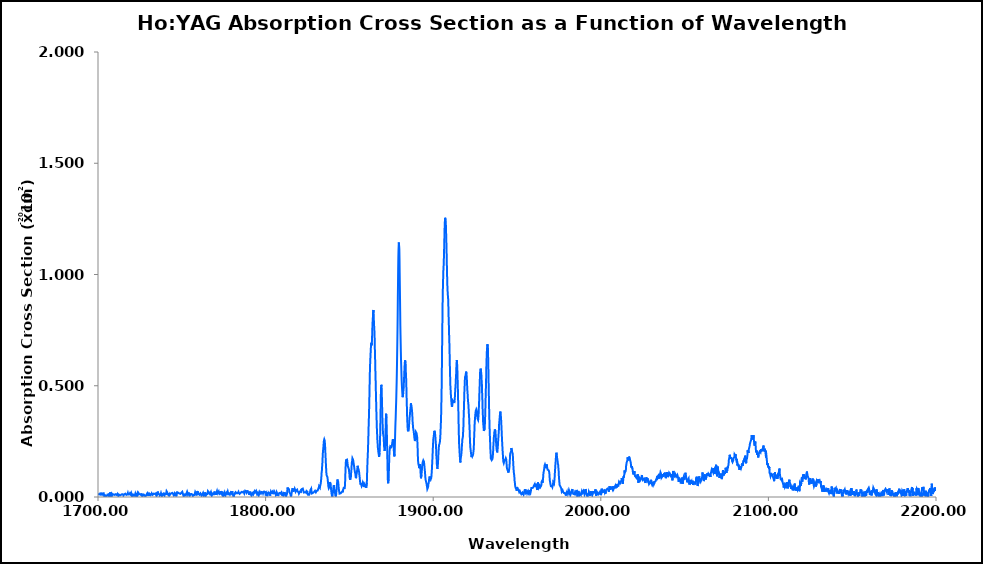
| Category | Series 0 |
|---|---|
| 1700.0 | 0.013 |
| 1700.1 | 0.012 |
| 1700.2 | 0.011 |
| 1700.3 | 0.011 |
| 1700.4 | 0.012 |
| 1700.5 | 0.014 |
| 1700.6 | 0.012 |
| 1700.7 | 0.012 |
| 1700.8 | 0.011 |
| 1700.9 | 0.011 |
| 1701.0 | 0.012 |
| 1701.1 | 0.014 |
| 1701.2 | 0.011 |
| 1701.3 | 0.016 |
| 1701.4 | 0.016 |
| 1701.5 | 0.014 |
| 1701.6 | 0.015 |
| 1701.7 | 0.016 |
| 1701.8 | 0.015 |
| 1701.9 | 0.017 |
| 1702.0 | 0.017 |
| 1702.1 | 0.017 |
| 1702.2 | 0.015 |
| 1702.3 | 0.015 |
| 1702.4 | 0.011 |
| 1702.5 | 0.012 |
| 1702.6 | 0.014 |
| 1702.7 | 0.011 |
| 1702.8 | 0.016 |
| 1702.9 | 0.016 |
| 1703.0 | 0.015 |
| 1703.1 | 0.016 |
| 1703.2 | 0.015 |
| 1703.3 | 0.017 |
| 1703.4 | 0.017 |
| 1703.5 | 0.017 |
| 1703.6 | 0.009 |
| 1703.7 | 0.003 |
| 1703.8 | 0.003 |
| 1703.9 | 0.004 |
| 1704.0 | 0.005 |
| 1704.1 | 0.006 |
| 1704.2 | 0.007 |
| 1704.3 | 0.007 |
| 1704.4 | 0.008 |
| 1704.5 | 0.01 |
| 1704.6 | 0.01 |
| 1704.7 | 0.006 |
| 1704.8 | 0.002 |
| 1704.9 | 0.002 |
| 1705.0 | 0.003 |
| 1705.1 | 0.002 |
| 1705.2 | 0.003 |
| 1705.3 | 0.005 |
| 1705.4 | 0.006 |
| 1705.5 | 0.007 |
| 1705.6 | 0.011 |
| 1705.7 | 0.011 |
| 1705.8 | 0.012 |
| 1705.9 | 0.014 |
| 1706.0 | 0.014 |
| 1706.1 | 0.011 |
| 1706.2 | 0.012 |
| 1706.3 | 0.013 |
| 1706.4 | 0.011 |
| 1706.5 | 0.011 |
| 1706.6 | 0.005 |
| 1706.7 | 0 |
| 1706.8 | 0 |
| 1706.9 | 0.002 |
| 1707.0 | 0.004 |
| 1707.1 | 0.014 |
| 1707.2 | 0.021 |
| 1707.3 | 0.016 |
| 1707.4 | 0.016 |
| 1707.5 | 0.013 |
| 1707.6 | 0.008 |
| 1707.7 | 0.001 |
| 1707.8 | 0.013 |
| 1707.9 | 0.001 |
| 1708.0 | 0.001 |
| 1708.1 | 0.005 |
| 1708.2 | 0.009 |
| 1708.3 | 0.015 |
| 1708.4 | 0.013 |
| 1708.5 | 0.014 |
| 1708.6 | 0.012 |
| 1708.7 | 0.012 |
| 1708.8 | 0.01 |
| 1708.9 | 0.008 |
| 1709.0 | 0.007 |
| 1709.1 | 0.006 |
| 1709.2 | 0.008 |
| 1709.3 | 0.011 |
| 1709.4 | 0.012 |
| 1709.5 | 0.012 |
| 1709.6 | 0.012 |
| 1709.7 | 0.014 |
| 1709.8 | 0.013 |
| 1709.9 | 0.011 |
| 1710.0 | 0.009 |
| 1710.1 | 0.012 |
| 1710.2 | 0.011 |
| 1710.3 | 0.006 |
| 1710.4 | 0.01 |
| 1710.5 | 0.011 |
| 1710.6 | 0.013 |
| 1710.7 | 0.01 |
| 1710.8 | 0.009 |
| 1710.9 | 0.011 |
| 1711.0 | 0.01 |
| 1711.1 | 0.009 |
| 1711.2 | 0.009 |
| 1711.3 | 0.01 |
| 1711.4 | 0.01 |
| 1711.5 | 0.011 |
| 1711.6 | 0.01 |
| 1711.7 | 0.015 |
| 1711.8 | 0.016 |
| 1711.9 | 0.015 |
| 1712.0 | 0.016 |
| 1712.1 | 0.01 |
| 1712.2 | 0.005 |
| 1712.3 | 0.006 |
| 1712.4 | 0.006 |
| 1712.5 | 0.004 |
| 1712.6 | 0.01 |
| 1712.7 | 0.012 |
| 1712.8 | 0.011 |
| 1712.9 | 0.01 |
| 1713.0 | 0.009 |
| 1713.1 | 0.007 |
| 1713.2 | 0.007 |
| 1713.3 | 0.007 |
| 1713.4 | 0.006 |
| 1713.5 | 0.007 |
| 1713.6 | 0.009 |
| 1713.7 | 0.009 |
| 1713.8 | 0.01 |
| 1713.9 | 0.008 |
| 1714.0 | 0.008 |
| 1714.1 | 0.009 |
| 1714.2 | 0.007 |
| 1714.3 | 0.008 |
| 1714.4 | 0.013 |
| 1714.5 | 0.011 |
| 1714.6 | 0.009 |
| 1714.7 | 0.012 |
| 1714.8 | 0.013 |
| 1714.9 | 0.01 |
| 1715.0 | 0.011 |
| 1715.1 | 0.008 |
| 1715.2 | 0.007 |
| 1715.3 | 0.004 |
| 1715.4 | 0.008 |
| 1715.5 | 0.006 |
| 1715.6 | 0.009 |
| 1715.7 | 0.012 |
| 1715.8 | 0.012 |
| 1715.9 | 0.01 |
| 1716.0 | 0.012 |
| 1716.1 | 0.009 |
| 1716.2 | 0.011 |
| 1716.3 | 0.015 |
| 1716.4 | 0.017 |
| 1716.5 | 0.016 |
| 1716.6 | 0.018 |
| 1716.7 | 0.014 |
| 1716.8 | 0.011 |
| 1716.9 | 0.01 |
| 1717.0 | 0.009 |
| 1717.1 | 0.011 |
| 1717.2 | 0.011 |
| 1717.3 | 0.006 |
| 1717.4 | 0.01 |
| 1717.5 | 0.012 |
| 1717.6 | 0.012 |
| 1717.7 | 0.013 |
| 1717.8 | 0.018 |
| 1717.9 | 0.014 |
| 1718.0 | 0.012 |
| 1718.1 | 0.011 |
| 1718.2 | 0.013 |
| 1718.3 | 0.013 |
| 1718.4 | 0.014 |
| 1718.5 | 0.014 |
| 1718.6 | 0.012 |
| 1718.7 | 0.011 |
| 1718.8 | 0.012 |
| 1718.9 | 0.013 |
| 1719.0 | 0.016 |
| 1719.1 | 0.016 |
| 1719.2 | 0.016 |
| 1719.3 | 0.014 |
| 1719.4 | 0.012 |
| 1719.5 | 0.012 |
| 1719.6 | 0.015 |
| 1719.7 | 0.014 |
| 1719.8 | 0.019 |
| 1719.9 | 0.016 |
| 1720.0 | 0.015 |
| 1720.1 | 0.012 |
| 1720.2 | 0.01 |
| 1720.3 | 0.002 |
| 1720.4 | 0.004 |
| 1720.5 | 0.004 |
| 1720.6 | 0.002 |
| 1720.7 | 0.003 |
| 1720.8 | 0.01 |
| 1720.9 | 0.011 |
| 1721.0 | 0.007 |
| 1721.1 | 0.01 |
| 1721.2 | 0.009 |
| 1721.3 | 0.007 |
| 1721.4 | 0.006 |
| 1721.5 | 0.011 |
| 1721.6 | 0.011 |
| 1721.7 | 0.01 |
| 1721.8 | 0.008 |
| 1721.9 | 0.012 |
| 1722.0 | 0.01 |
| 1722.1 | 0.01 |
| 1722.2 | 0.014 |
| 1722.3 | 0.015 |
| 1722.4 | 0.013 |
| 1722.5 | 0.01 |
| 1722.6 | 0.003 |
| 1722.7 | 0.002 |
| 1722.8 | 0.018 |
| 1722.9 | 0.012 |
| 1723.0 | 0 |
| 1723.1 | 0.011 |
| 1723.2 | 0.009 |
| 1723.3 | 0.014 |
| 1723.4 | 0.016 |
| 1723.5 | 0.013 |
| 1723.6 | 0.007 |
| 1723.7 | 0.012 |
| 1723.8 | 0.008 |
| 1723.9 | 0.012 |
| 1724.0 | 0.016 |
| 1724.1 | 0.019 |
| 1724.2 | 0.021 |
| 1724.3 | 0.021 |
| 1724.4 | 0.02 |
| 1724.5 | 0.018 |
| 1724.6 | 0.018 |
| 1724.7 | 0.012 |
| 1724.8 | 0.012 |
| 1724.9 | 0.011 |
| 1725.0 | 0.009 |
| 1725.1 | 0.009 |
| 1725.2 | 0.009 |
| 1725.3 | 0.012 |
| 1725.4 | 0.012 |
| 1725.5 | 0.01 |
| 1725.6 | 0.012 |
| 1725.7 | 0.012 |
| 1725.8 | 0.008 |
| 1725.9 | 0.008 |
| 1726.0 | 0.013 |
| 1726.1 | 0.013 |
| 1726.2 | 0.013 |
| 1726.3 | 0.016 |
| 1726.4 | 0.016 |
| 1726.5 | 0.014 |
| 1726.6 | 0.012 |
| 1726.7 | 0.008 |
| 1726.8 | 0.006 |
| 1726.9 | 0.007 |
| 1727.0 | 0.006 |
| 1727.1 | 0.005 |
| 1727.2 | 0.009 |
| 1727.3 | 0.011 |
| 1727.4 | 0.01 |
| 1727.5 | 0.009 |
| 1727.6 | 0.009 |
| 1727.7 | 0.009 |
| 1727.8 | 0.008 |
| 1727.9 | 0.007 |
| 1728.0 | 0.006 |
| 1728.1 | 0.007 |
| 1728.2 | 0.002 |
| 1728.3 | 0.004 |
| 1728.4 | 0.006 |
| 1728.5 | 0.001 |
| 1728.6 | 0.002 |
| 1728.7 | 0.007 |
| 1728.8 | 0.007 |
| 1728.9 | 0.011 |
| 1729.0 | 0.011 |
| 1729.1 | 0.013 |
| 1729.2 | 0.01 |
| 1729.3 | 0.006 |
| 1729.4 | 0.012 |
| 1729.5 | 0.012 |
| 1729.6 | 0.014 |
| 1729.7 | 0.018 |
| 1729.8 | 0.022 |
| 1729.9 | 0.017 |
| 1730.0 | 0.02 |
| 1730.1 | 0.015 |
| 1730.2 | 0.015 |
| 1730.3 | 0.012 |
| 1730.4 | 0.012 |
| 1730.5 | 0.005 |
| 1730.6 | 0.006 |
| 1730.7 | 0.007 |
| 1730.8 | 0.013 |
| 1730.9 | 0.013 |
| 1731.0 | 0.016 |
| 1731.1 | 0.015 |
| 1731.2 | 0.015 |
| 1731.3 | 0.009 |
| 1731.4 | 0.011 |
| 1731.5 | 0.012 |
| 1731.6 | 0.012 |
| 1731.7 | 0.012 |
| 1731.8 | 0.014 |
| 1731.9 | 0.008 |
| 1732.0 | 0.011 |
| 1732.1 | 0.015 |
| 1732.2 | 0.016 |
| 1732.3 | 0.016 |
| 1732.4 | 0.017 |
| 1732.5 | 0.015 |
| 1732.6 | 0.01 |
| 1732.7 | 0.009 |
| 1732.8 | 0.007 |
| 1732.9 | 0.012 |
| 1733.0 | 0.008 |
| 1733.1 | 0.013 |
| 1733.2 | 0.015 |
| 1733.3 | 0.019 |
| 1733.4 | 0.015 |
| 1733.5 | 0.019 |
| 1733.6 | 0.017 |
| 1733.7 | 0.018 |
| 1733.8 | 0.014 |
| 1733.9 | 0.015 |
| 1734.0 | 0.014 |
| 1734.1 | 0.013 |
| 1734.2 | 0.012 |
| 1734.3 | 0.015 |
| 1734.4 | 0.016 |
| 1734.5 | 0.013 |
| 1734.6 | 0.01 |
| 1734.7 | 0.01 |
| 1734.8 | 0.008 |
| 1734.9 | 0.004 |
| 1735.0 | 0.006 |
| 1735.1 | 0.008 |
| 1735.2 | 0.009 |
| 1735.3 | 0.01 |
| 1735.4 | 0.013 |
| 1735.5 | 0.019 |
| 1735.6 | 0.024 |
| 1735.7 | 0.022 |
| 1735.8 | 0.022 |
| 1735.9 | 0.025 |
| 1736.0 | 0.022 |
| 1736.1 | 0.014 |
| 1736.2 | 0.017 |
| 1736.3 | 0.018 |
| 1736.4 | 0.015 |
| 1736.5 | 0.013 |
| 1736.6 | 0.014 |
| 1736.7 | 0.012 |
| 1736.8 | 0.007 |
| 1736.9 | 0.004 |
| 1737.0 | 0.004 |
| 1737.1 | 0.004 |
| 1737.2 | 0.009 |
| 1737.3 | 0.009 |
| 1737.4 | 0.012 |
| 1737.5 | 0.013 |
| 1737.6 | 0.017 |
| 1737.7 | 0.014 |
| 1737.8 | 0.014 |
| 1737.9 | 0.01 |
| 1738.0 | 0.008 |
| 1738.1 | 0.003 |
| 1738.2 | 0.004 |
| 1738.3 | 0.002 |
| 1738.4 | 0.006 |
| 1738.5 | 0.008 |
| 1738.6 | 0.014 |
| 1738.7 | 0.011 |
| 1738.8 | 0.011 |
| 1738.9 | 0.013 |
| 1739.0 | 0.014 |
| 1739.1 | 0.013 |
| 1739.2 | 0.016 |
| 1739.3 | 0.019 |
| 1739.4 | 0.019 |
| 1739.5 | 0.013 |
| 1739.6 | 0.012 |
| 1739.7 | 0.007 |
| 1739.8 | 0.008 |
| 1739.9 | 0.008 |
| 1740.0 | 0.014 |
| 1740.1 | 0.014 |
| 1740.2 | 0.014 |
| 1740.3 | 0.016 |
| 1740.4 | 0.013 |
| 1740.5 | 0.011 |
| 1740.6 | 0.013 |
| 1740.7 | 0.019 |
| 1740.8 | 0.022 |
| 1740.9 | 0.026 |
| 1741.0 | 0.031 |
| 1741.1 | 0.028 |
| 1741.2 | 0.027 |
| 1741.3 | 0.021 |
| 1741.4 | 0.017 |
| 1741.5 | 0.014 |
| 1741.6 | 0.012 |
| 1741.7 | 0.012 |
| 1741.8 | 0.011 |
| 1741.9 | 0.011 |
| 1742.0 | 0.009 |
| 1742.1 | 0.011 |
| 1742.2 | 0.012 |
| 1742.3 | 0.01 |
| 1742.4 | 0.012 |
| 1742.5 | 0.014 |
| 1742.6 | 0.014 |
| 1742.7 | 0.008 |
| 1742.8 | 0.009 |
| 1742.9 | 0.008 |
| 1743.0 | 0.01 |
| 1743.1 | 0.01 |
| 1743.2 | 0.013 |
| 1743.3 | 0.013 |
| 1743.4 | 0.011 |
| 1743.5 | 0.011 |
| 1743.6 | 0.013 |
| 1743.7 | 0.016 |
| 1743.8 | 0.017 |
| 1743.9 | 0.021 |
| 1744.0 | 0.019 |
| 1744.1 | 0.016 |
| 1744.2 | 0.014 |
| 1744.3 | 0.016 |
| 1744.4 | 0.019 |
| 1744.5 | 0.018 |
| 1744.6 | 0.018 |
| 1744.7 | 0.017 |
| 1744.8 | 0.014 |
| 1744.9 | 0.01 |
| 1745.0 | 0.013 |
| 1745.1 | 0.009 |
| 1745.2 | 0.01 |
| 1745.3 | 0.012 |
| 1745.4 | 0.011 |
| 1745.5 | 0.012 |
| 1745.6 | 0.016 |
| 1745.7 | 0.012 |
| 1745.8 | 0.01 |
| 1745.9 | 0.009 |
| 1746.0 | 0.009 |
| 1746.1 | 0.012 |
| 1746.2 | 0.012 |
| 1746.3 | 0.013 |
| 1746.4 | 0.015 |
| 1746.5 | 0.011 |
| 1746.6 | 0.003 |
| 1746.7 | 0.006 |
| 1746.8 | 0.006 |
| 1746.9 | 0.009 |
| 1747.0 | 0.01 |
| 1747.1 | 0.018 |
| 1747.2 | 0.024 |
| 1747.3 | 0.025 |
| 1747.4 | 0.017 |
| 1747.5 | 0.02 |
| 1747.6 | 0.019 |
| 1747.7 | 0.014 |
| 1747.8 | 0.013 |
| 1747.9 | 0.017 |
| 1748.0 | 0.019 |
| 1748.1 | 0.016 |
| 1748.2 | 0.018 |
| 1748.3 | 0.019 |
| 1748.4 | 0.016 |
| 1748.5 | 0.015 |
| 1748.6 | 0.015 |
| 1748.7 | 0.013 |
| 1748.8 | 0.011 |
| 1748.9 | 0.014 |
| 1749.0 | 0.014 |
| 1749.1 | 0.014 |
| 1749.2 | 0.014 |
| 1749.3 | 0.018 |
| 1749.4 | 0.016 |
| 1749.5 | 0.014 |
| 1749.6 | 0.016 |
| 1749.7 | 0.019 |
| 1749.8 | 0.015 |
| 1749.9 | 0.018 |
| 1750.0 | 0.021 |
| 1750.1 | 0.018 |
| 1750.2 | 0.016 |
| 1750.3 | 0.023 |
| 1750.4 | 0.021 |
| 1750.5 | 0.018 |
| 1750.6 | 0.02 |
| 1750.7 | 0.017 |
| 1750.8 | 0.01 |
| 1750.9 | 0.008 |
| 1751.0 | 0.007 |
| 1751.1 | 0.003 |
| 1751.2 | 0.006 |
| 1751.3 | 0.008 |
| 1751.4 | 0.01 |
| 1751.5 | 0.011 |
| 1751.6 | 0.015 |
| 1751.7 | 0.013 |
| 1751.8 | 0.007 |
| 1751.9 | 0.01 |
| 1752.0 | 0.006 |
| 1752.1 | 0.003 |
| 1752.2 | 0.004 |
| 1752.3 | 0.01 |
| 1752.4 | 0.006 |
| 1752.5 | 0.013 |
| 1752.6 | 0.016 |
| 1752.7 | 0.012 |
| 1752.8 | 0.011 |
| 1752.9 | 0.018 |
| 1753.0 | 0.017 |
| 1753.1 | 0.016 |
| 1753.2 | 0.024 |
| 1753.3 | 0.026 |
| 1753.4 | 0.022 |
| 1753.5 | 0.017 |
| 1753.6 | 0.018 |
| 1753.7 | 0.01 |
| 1753.8 | 0.01 |
| 1753.9 | 0.01 |
| 1754.0 | 0.014 |
| 1754.1 | 0.014 |
| 1754.2 | 0.02 |
| 1754.3 | 0.013 |
| 1754.4 | 0.014 |
| 1754.5 | 0.013 |
| 1754.6 | 0.013 |
| 1754.7 | 0.008 |
| 1754.8 | 0.014 |
| 1754.9 | 0.013 |
| 1755.0 | 0.01 |
| 1755.1 | 0.007 |
| 1755.2 | 0.013 |
| 1755.3 | 0.01 |
| 1755.4 | 0.011 |
| 1755.5 | 0.013 |
| 1755.6 | 0.016 |
| 1755.7 | 0.016 |
| 1755.8 | 0.014 |
| 1755.9 | 0.012 |
| 1756.0 | 0.016 |
| 1756.1 | 0.013 |
| 1756.2 | 0.009 |
| 1756.3 | 0.013 |
| 1756.4 | 0.011 |
| 1756.5 | 0.008 |
| 1756.6 | 0.005 |
| 1756.7 | 0.007 |
| 1756.8 | 0.006 |
| 1756.9 | 0.009 |
| 1757.0 | 0.007 |
| 1757.1 | 0.01 |
| 1757.2 | 0.01 |
| 1757.3 | 0.01 |
| 1757.4 | 0.01 |
| 1757.5 | 0.009 |
| 1757.6 | 0.013 |
| 1757.7 | 0.013 |
| 1757.8 | 0.016 |
| 1757.9 | 0.02 |
| 1758.0 | 0.022 |
| 1758.1 | 0.023 |
| 1758.2 | 0.024 |
| 1758.3 | 0.024 |
| 1758.4 | 0.02 |
| 1758.5 | 0.02 |
| 1758.6 | 0.012 |
| 1758.7 | 0.009 |
| 1758.8 | 0.007 |
| 1758.9 | 0.007 |
| 1759.0 | 0.011 |
| 1759.1 | 0.02 |
| 1759.2 | 0.024 |
| 1759.3 | 0.026 |
| 1759.4 | 0.024 |
| 1759.5 | 0.022 |
| 1759.6 | 0.019 |
| 1759.7 | 0.017 |
| 1759.8 | 0.01 |
| 1759.9 | 0.017 |
| 1760.0 | 0.02 |
| 1760.1 | 0.018 |
| 1760.2 | 0.019 |
| 1760.3 | 0.02 |
| 1760.4 | 0.015 |
| 1760.5 | 0.011 |
| 1760.6 | 0.009 |
| 1760.7 | 0.009 |
| 1760.8 | 0.014 |
| 1760.9 | 0.014 |
| 1761.0 | 0.015 |
| 1761.1 | 0.016 |
| 1761.2 | 0.016 |
| 1761.3 | 0.012 |
| 1761.4 | 0.013 |
| 1761.5 | 0.01 |
| 1761.6 | 0.01 |
| 1761.7 | 0.009 |
| 1761.8 | 0.005 |
| 1761.9 | 0.009 |
| 1762.0 | 0.01 |
| 1762.1 | 0.01 |
| 1762.2 | 0.009 |
| 1762.3 | 0.013 |
| 1762.4 | 0.011 |
| 1762.5 | 0.013 |
| 1762.6 | 0.014 |
| 1762.7 | 0.019 |
| 1762.8 | 0.02 |
| 1762.9 | 0.019 |
| 1763.0 | 0.012 |
| 1763.1 | 0.009 |
| 1763.2 | 0.005 |
| 1763.3 | 0.005 |
| 1763.4 | 0.005 |
| 1763.5 | 0.007 |
| 1763.6 | 0.009 |
| 1763.7 | 0.01 |
| 1763.8 | 0.016 |
| 1763.9 | 0.018 |
| 1764.0 | 0.021 |
| 1764.1 | 0.017 |
| 1764.2 | 0.013 |
| 1764.3 | 0.006 |
| 1764.4 | 0.004 |
| 1764.5 | 0.003 |
| 1764.6 | 0.006 |
| 1764.7 | 0.011 |
| 1764.8 | 0.012 |
| 1764.9 | 0.011 |
| 1765.0 | 0.011 |
| 1765.1 | 0.014 |
| 1765.2 | 0.014 |
| 1765.3 | 0.013 |
| 1765.4 | 0.016 |
| 1765.5 | 0.022 |
| 1765.6 | 0.026 |
| 1765.7 | 0.028 |
| 1765.8 | 0.027 |
| 1765.9 | 0.027 |
| 1766.0 | 0.026 |
| 1766.1 | 0.023 |
| 1766.2 | 0.02 |
| 1766.3 | 0.02 |
| 1766.4 | 0.022 |
| 1766.5 | 0.018 |
| 1766.6 | 0.015 |
| 1766.7 | 0.018 |
| 1766.8 | 0.024 |
| 1766.9 | 0.021 |
| 1767.0 | 0.024 |
| 1767.1 | 0.017 |
| 1767.2 | 0.021 |
| 1767.3 | 0.02 |
| 1767.4 | 0.022 |
| 1767.5 | 0.02 |
| 1767.6 | 0.022 |
| 1767.7 | 0.018 |
| 1767.8 | 0.012 |
| 1767.9 | 0.007 |
| 1768.0 | 0.005 |
| 1768.1 | 0.011 |
| 1768.2 | 0.006 |
| 1768.3 | 0.011 |
| 1768.4 | 0.015 |
| 1768.5 | 0.019 |
| 1768.6 | 0.015 |
| 1768.7 | 0.019 |
| 1768.8 | 0.015 |
| 1768.9 | 0.013 |
| 1769.0 | 0.012 |
| 1769.1 | 0.009 |
| 1769.2 | 0.011 |
| 1769.3 | 0.019 |
| 1769.4 | 0.02 |
| 1769.5 | 0.018 |
| 1769.6 | 0.025 |
| 1769.7 | 0.017 |
| 1769.8 | 0.015 |
| 1769.9 | 0.014 |
| 1770.0 | 0.01 |
| 1770.1 | 0.012 |
| 1770.2 | 0.017 |
| 1770.3 | 0.013 |
| 1770.4 | 0.01 |
| 1770.5 | 0.015 |
| 1770.6 | 0.016 |
| 1770.7 | 0.017 |
| 1770.8 | 0.017 |
| 1770.9 | 0.019 |
| 1771.0 | 0.027 |
| 1771.1 | 0.023 |
| 1771.2 | 0.02 |
| 1771.3 | 0.025 |
| 1771.4 | 0.025 |
| 1771.5 | 0.018 |
| 1771.6 | 0.018 |
| 1771.7 | 0.019 |
| 1771.8 | 0.019 |
| 1771.9 | 0.019 |
| 1772.0 | 0.024 |
| 1772.1 | 0.02 |
| 1772.2 | 0.018 |
| 1772.3 | 0.017 |
| 1772.4 | 0.016 |
| 1772.5 | 0.013 |
| 1772.6 | 0.016 |
| 1772.7 | 0.017 |
| 1772.8 | 0.012 |
| 1772.9 | 0.013 |
| 1773.0 | 0.016 |
| 1773.1 | 0.015 |
| 1773.2 | 0.02 |
| 1773.3 | 0.027 |
| 1773.4 | 0.027 |
| 1773.5 | 0.02 |
| 1773.6 | 0.019 |
| 1773.7 | 0.02 |
| 1773.8 | 0.015 |
| 1773.9 | 0.017 |
| 1774.0 | 0.024 |
| 1774.1 | 0.021 |
| 1774.2 | 0.014 |
| 1774.3 | 0.013 |
| 1774.4 | 0.01 |
| 1774.5 | 0.007 |
| 1774.6 | 0.011 |
| 1774.7 | 0.013 |
| 1774.8 | 0.011 |
| 1774.9 | 0.009 |
| 1775.0 | 0.007 |
| 1775.1 | 0.005 |
| 1775.2 | 0.007 |
| 1775.3 | 0.012 |
| 1775.4 | 0.013 |
| 1775.5 | 0.016 |
| 1775.6 | 0.02 |
| 1775.7 | 0.02 |
| 1775.8 | 0.015 |
| 1775.9 | 0.016 |
| 1776.0 | 0.014 |
| 1776.1 | 0.008 |
| 1776.2 | 0.005 |
| 1776.3 | 0.013 |
| 1776.4 | 0.012 |
| 1776.5 | 0.017 |
| 1776.6 | 0.016 |
| 1776.7 | 0.019 |
| 1776.8 | 0.016 |
| 1776.9 | 0.015 |
| 1777.0 | 0.011 |
| 1777.1 | 0.017 |
| 1777.2 | 0.017 |
| 1777.3 | 0.02 |
| 1777.4 | 0.025 |
| 1777.5 | 0.021 |
| 1777.6 | 0.019 |
| 1777.7 | 0.017 |
| 1777.8 | 0.013 |
| 1777.9 | 0.011 |
| 1778.0 | 0.015 |
| 1778.1 | 0.017 |
| 1778.2 | 0.014 |
| 1778.3 | 0.015 |
| 1778.4 | 0.016 |
| 1778.5 | 0.013 |
| 1778.6 | 0.011 |
| 1778.7 | 0.011 |
| 1778.8 | 0.013 |
| 1778.9 | 0.014 |
| 1779.0 | 0.013 |
| 1779.1 | 0.011 |
| 1779.2 | 0.02 |
| 1779.3 | 0.023 |
| 1779.4 | 0.022 |
| 1779.5 | 0.022 |
| 1779.6 | 0.023 |
| 1779.7 | 0.021 |
| 1779.8 | 0.014 |
| 1779.9 | 0.016 |
| 1780.0 | 0.02 |
| 1780.1 | 0.026 |
| 1780.2 | 0.018 |
| 1780.3 | 0.019 |
| 1780.4 | 0.015 |
| 1780.5 | 0.018 |
| 1780.6 | 0.009 |
| 1780.7 | 0.013 |
| 1780.8 | 0.012 |
| 1780.9 | 0.01 |
| 1781.0 | 0.001 |
| 1781.1 | 0.007 |
| 1781.2 | 0.011 |
| 1781.3 | 0.011 |
| 1781.4 | 0.013 |
| 1781.5 | 0.019 |
| 1781.6 | 0.014 |
| 1781.7 | 0.01 |
| 1781.8 | 0.012 |
| 1781.9 | 0.017 |
| 1782.0 | 0.017 |
| 1782.1 | 0.022 |
| 1782.2 | 0.021 |
| 1782.3 | 0.023 |
| 1782.4 | 0.02 |
| 1782.5 | 0.019 |
| 1782.6 | 0.018 |
| 1782.7 | 0.017 |
| 1782.8 | 0.017 |
| 1782.9 | 0.018 |
| 1783.0 | 0.018 |
| 1783.1 | 0.017 |
| 1783.2 | 0.013 |
| 1783.3 | 0.017 |
| 1783.4 | 0.016 |
| 1783.5 | 0.016 |
| 1783.6 | 0.017 |
| 1783.7 | 0.022 |
| 1783.8 | 0.014 |
| 1783.9 | 0.015 |
| 1784.0 | 0.019 |
| 1784.1 | 0.021 |
| 1784.2 | 0.023 |
| 1784.3 | 0.022 |
| 1784.4 | 0.019 |
| 1784.5 | 0.014 |
| 1784.6 | 0.012 |
| 1784.7 | 0.01 |
| 1784.8 | 0.014 |
| 1784.9 | 0.013 |
| 1785.0 | 0.017 |
| 1785.1 | 0.018 |
| 1785.2 | 0.021 |
| 1785.3 | 0.022 |
| 1785.4 | 0.022 |
| 1785.5 | 0.021 |
| 1785.6 | 0.023 |
| 1785.7 | 0.022 |
| 1785.8 | 0.023 |
| 1785.9 | 0.025 |
| 1786.0 | 0.022 |
| 1786.1 | 0.021 |
| 1786.2 | 0.021 |
| 1786.3 | 0.021 |
| 1786.4 | 0.021 |
| 1786.5 | 0.022 |
| 1786.6 | 0.021 |
| 1786.7 | 0.023 |
| 1786.8 | 0.024 |
| 1786.9 | 0.023 |
| 1787.0 | 0.022 |
| 1787.1 | 0.023 |
| 1787.2 | 0.021 |
| 1787.3 | 0.015 |
| 1787.4 | 0.015 |
| 1787.5 | 0.019 |
| 1787.6 | 0.022 |
| 1787.7 | 0.022 |
| 1787.8 | 0.028 |
| 1787.9 | 0.031 |
| 1788.0 | 0.029 |
| 1788.1 | 0.027 |
| 1788.2 | 0.026 |
| 1788.3 | 0.027 |
| 1788.4 | 0.026 |
| 1788.5 | 0.024 |
| 1788.6 | 0.023 |
| 1788.7 | 0.02 |
| 1788.8 | 0.02 |
| 1788.9 | 0.019 |
| 1789.0 | 0.024 |
| 1789.1 | 0.03 |
| 1789.2 | 0.029 |
| 1789.3 | 0.024 |
| 1789.4 | 0.027 |
| 1789.5 | 0.027 |
| 1789.6 | 0.023 |
| 1789.7 | 0.025 |
| 1789.8 | 0.026 |
| 1789.9 | 0.02 |
| 1790.0 | 0.018 |
| 1790.1 | 0.01 |
| 1790.2 | 0.011 |
| 1790.3 | 0.011 |
| 1790.4 | 0.014 |
| 1790.5 | 0.013 |
| 1790.6 | 0.02 |
| 1790.7 | 0.021 |
| 1790.8 | 0.024 |
| 1790.9 | 0.02 |
| 1791.0 | 0.022 |
| 1791.1 | 0.021 |
| 1791.2 | 0.019 |
| 1791.3 | 0.01 |
| 1791.4 | 0.009 |
| 1791.5 | 0.007 |
| 1791.6 | 0.005 |
| 1791.7 | 0.002 |
| 1791.8 | 0.002 |
| 1791.9 | 0.009 |
| 1792.0 | 0.007 |
| 1792.1 | 0.014 |
| 1792.2 | 0.019 |
| 1792.3 | 0.022 |
| 1792.4 | 0.021 |
| 1792.5 | 0.022 |
| 1792.6 | 0.02 |
| 1792.7 | 0.02 |
| 1792.8 | 0.022 |
| 1792.9 | 0.017 |
| 1793.0 | 0.018 |
| 1793.1 | 0.016 |
| 1793.2 | 0.017 |
| 1793.3 | 0.018 |
| 1793.4 | 0.026 |
| 1793.5 | 0.026 |
| 1793.6 | 0.026 |
| 1793.7 | 0.021 |
| 1793.8 | 0.019 |
| 1793.9 | 0.02 |
| 1794.0 | 0.022 |
| 1794.1 | 0.022 |
| 1794.2 | 0.025 |
| 1794.3 | 0.027 |
| 1794.4 | 0.026 |
| 1794.5 | 0.02 |
| 1794.6 | 0.021 |
| 1794.7 | 0.022 |
| 1794.8 | 0.017 |
| 1794.9 | 0.012 |
| 1795.0 | 0.014 |
| 1795.1 | 0.014 |
| 1795.2 | 0.012 |
| 1795.3 | 0.016 |
| 1795.4 | 0.02 |
| 1795.5 | 0.02 |
| 1795.6 | 0.014 |
| 1795.7 | 0.017 |
| 1795.8 | 0.013 |
| 1795.9 | 0.007 |
| 1796.0 | 0.006 |
| 1796.1 | 0.012 |
| 1796.2 | 0.008 |
| 1796.3 | 0.015 |
| 1796.4 | 0.019 |
| 1796.5 | 0.019 |
| 1796.6 | 0.024 |
| 1796.7 | 0.027 |
| 1796.8 | 0.023 |
| 1796.9 | 0.026 |
| 1797.0 | 0.026 |
| 1797.1 | 0.025 |
| 1797.2 | 0.016 |
| 1797.3 | 0.018 |
| 1797.4 | 0.02 |
| 1797.5 | 0.022 |
| 1797.6 | 0.017 |
| 1797.7 | 0.022 |
| 1797.8 | 0.023 |
| 1797.9 | 0.021 |
| 1798.0 | 0.019 |
| 1798.1 | 0.023 |
| 1798.2 | 0.024 |
| 1798.3 | 0.021 |
| 1798.4 | 0.019 |
| 1798.5 | 0.016 |
| 1798.6 | 0.019 |
| 1798.7 | 0.018 |
| 1798.8 | 0.022 |
| 1798.9 | 0.022 |
| 1799.0 | 0.028 |
| 1799.1 | 0.021 |
| 1799.2 | 0.02 |
| 1799.3 | 0.018 |
| 1799.4 | 0.021 |
| 1799.5 | 0.021 |
| 1799.6 | 0.023 |
| 1799.7 | 0.022 |
| 1799.8 | 0.021 |
| 1799.9 | 0.017 |
| 1800.0 | 0.013 |
| 1800.1 | 0.01 |
| 1800.2 | 0.012 |
| 1800.3 | 0.014 |
| 1800.4 | 0.015 |
| 1800.5 | 0.019 |
| 1800.6 | 0.013 |
| 1800.7 | 0.016 |
| 1800.8 | 0.009 |
| 1800.9 | 0.009 |
| 1801.0 | 0.004 |
| 1801.1 | 0.01 |
| 1801.2 | 0.009 |
| 1801.3 | 0.015 |
| 1801.4 | 0.015 |
| 1801.5 | 0.02 |
| 1801.6 | 0.015 |
| 1801.7 | 0.017 |
| 1801.8 | 0.02 |
| 1801.9 | 0.017 |
| 1802.0 | 0.013 |
| 1802.1 | 0.018 |
| 1802.2 | 0.021 |
| 1802.3 | 0.016 |
| 1802.4 | 0.016 |
| 1802.5 | 0.021 |
| 1802.6 | 0.014 |
| 1802.7 | 0.006 |
| 1802.8 | 0.011 |
| 1802.9 | 0.014 |
| 1803.0 | 0.014 |
| 1803.1 | 0.02 |
| 1803.2 | 0.025 |
| 1803.3 | 0.021 |
| 1803.4 | 0.024 |
| 1803.5 | 0.023 |
| 1803.6 | 0.02 |
| 1803.7 | 0.014 |
| 1803.8 | 0.015 |
| 1803.9 | 0.014 |
| 1804.0 | 0.015 |
| 1804.1 | 0.018 |
| 1804.2 | 0.024 |
| 1804.3 | 0.024 |
| 1804.4 | 0.024 |
| 1804.5 | 0.023 |
| 1804.6 | 0.02 |
| 1804.7 | 0.019 |
| 1804.8 | 0.022 |
| 1804.9 | 0.021 |
| 1805.0 | 0.024 |
| 1805.1 | 0.023 |
| 1805.2 | 0.022 |
| 1805.3 | 0.019 |
| 1805.4 | 0.019 |
| 1805.5 | 0.013 |
| 1805.6 | 0.019 |
| 1805.7 | 0.017 |
| 1805.8 | 0.017 |
| 1805.9 | 0.013 |
| 1806.0 | 0.016 |
| 1806.1 | 0.009 |
| 1806.2 | 0.009 |
| 1806.3 | 0.005 |
| 1806.4 | 0.009 |
| 1806.5 | 0.008 |
| 1806.6 | 0.015 |
| 1806.7 | 0.02 |
| 1806.8 | 0.023 |
| 1806.9 | 0.022 |
| 1807.0 | 0.018 |
| 1807.1 | 0.013 |
| 1807.2 | 0.004 |
| 1807.3 | 0.003 |
| 1807.4 | 0.013 |
| 1807.5 | 0.006 |
| 1807.6 | 0.007 |
| 1807.7 | 0.012 |
| 1807.8 | 0.013 |
| 1807.9 | 0.016 |
| 1808.0 | 0.017 |
| 1808.1 | 0.017 |
| 1808.2 | 0.017 |
| 1808.3 | 0.02 |
| 1808.4 | 0.018 |
| 1808.5 | 0.015 |
| 1808.6 | 0.019 |
| 1808.7 | 0.02 |
| 1808.8 | 0.017 |
| 1808.9 | 0.017 |
| 1809.0 | 0.016 |
| 1809.1 | 0.015 |
| 1809.2 | 0.014 |
| 1809.3 | 0.016 |
| 1809.4 | 0.018 |
| 1809.5 | 0.02 |
| 1809.6 | 0.019 |
| 1809.7 | 0.021 |
| 1809.8 | 0.021 |
| 1809.9 | 0.017 |
| 1810.0 | 0.013 |
| 1810.1 | 0.009 |
| 1810.2 | 0.004 |
| 1810.3 | 0.002 |
| 1810.4 | 0.004 |
| 1810.5 | 0.013 |
| 1810.6 | 0.016 |
| 1810.7 | 0.012 |
| 1810.8 | 0.008 |
| 1810.9 | 0.012 |
| 1811.0 | 0.007 |
| 1811.1 | 0.008 |
| 1811.2 | 0.018 |
| 1811.3 | 0.023 |
| 1811.4 | 0.016 |
| 1811.5 | 0.017 |
| 1811.6 | 0.014 |
| 1811.7 | 0.01 |
| 1811.8 | 0.009 |
| 1811.9 | 0.018 |
| 1812.0 | 0.017 |
| 1812.1 | 0.013 |
| 1812.2 | 0.014 |
| 1812.3 | 0.016 |
| 1812.4 | 0.006 |
| 1812.5 | 0.002 |
| 1812.6 | 0.008 |
| 1812.7 | 0.009 |
| 1812.8 | 0.015 |
| 1812.9 | 0.026 |
| 1813.0 | 0.033 |
| 1813.1 | 0.043 |
| 1813.2 | 0.042 |
| 1813.3 | 0.04 |
| 1813.4 | 0.035 |
| 1813.5 | 0.035 |
| 1813.6 | 0.033 |
| 1813.7 | 0.039 |
| 1813.8 | 0.034 |
| 1813.9 | 0.038 |
| 1814.0 | 0.035 |
| 1814.1 | 0.025 |
| 1814.2 | 0.02 |
| 1814.3 | 0.02 |
| 1814.4 | 0.017 |
| 1814.5 | 0.019 |
| 1814.6 | 0.021 |
| 1814.7 | 0.019 |
| 1814.8 | 0.014 |
| 1814.9 | 0.008 |
| 1815.0 | 0.004 |
| 1815.1 | 0.003 |
| 1815.2 | 0.002 |
| 1815.3 | 0.007 |
| 1815.4 | 0.01 |
| 1815.5 | 0.016 |
| 1815.6 | 0.019 |
| 1815.7 | 0.026 |
| 1815.8 | 0.028 |
| 1815.9 | 0.035 |
| 1816.0 | 0.038 |
| 1816.1 | 0.039 |
| 1816.2 | 0.034 |
| 1816.3 | 0.036 |
| 1816.4 | 0.033 |
| 1816.5 | 0.027 |
| 1816.6 | 0.024 |
| 1816.7 | 0.027 |
| 1816.8 | 0.026 |
| 1816.9 | 0.023 |
| 1817.0 | 0.026 |
| 1817.1 | 0.028 |
| 1817.2 | 0.027 |
| 1817.3 | 0.03 |
| 1817.4 | 0.037 |
| 1817.5 | 0.036 |
| 1817.6 | 0.033 |
| 1817.7 | 0.031 |
| 1817.8 | 0.029 |
| 1817.9 | 0.024 |
| 1818.0 | 0.026 |
| 1818.1 | 0.029 |
| 1818.2 | 0.029 |
| 1818.3 | 0.027 |
| 1818.4 | 0.031 |
| 1818.5 | 0.03 |
| 1818.6 | 0.031 |
| 1818.7 | 0.032 |
| 1818.8 | 0.033 |
| 1818.9 | 0.029 |
| 1819.0 | 0.029 |
| 1819.1 | 0.025 |
| 1819.2 | 0.027 |
| 1819.3 | 0.022 |
| 1819.4 | 0.026 |
| 1819.5 | 0.023 |
| 1819.6 | 0.023 |
| 1819.7 | 0.021 |
| 1819.8 | 0.019 |
| 1819.9 | 0.015 |
| 1820.0 | 0.013 |
| 1820.1 | 0.015 |
| 1820.2 | 0.012 |
| 1820.3 | 0.017 |
| 1820.4 | 0.018 |
| 1820.5 | 0.025 |
| 1820.6 | 0.027 |
| 1820.7 | 0.028 |
| 1820.8 | 0.025 |
| 1820.9 | 0.027 |
| 1821.0 | 0.028 |
| 1821.1 | 0.023 |
| 1821.2 | 0.029 |
| 1821.3 | 0.035 |
| 1821.4 | 0.034 |
| 1821.5 | 0.03 |
| 1821.6 | 0.036 |
| 1821.7 | 0.031 |
| 1821.8 | 0.035 |
| 1821.9 | 0.032 |
| 1822.0 | 0.038 |
| 1822.1 | 0.037 |
| 1822.2 | 0.038 |
| 1822.3 | 0.035 |
| 1822.4 | 0.037 |
| 1822.5 | 0.028 |
| 1822.6 | 0.028 |
| 1822.7 | 0.025 |
| 1822.8 | 0.02 |
| 1822.9 | 0.016 |
| 1823.0 | 0.018 |
| 1823.1 | 0.017 |
| 1823.2 | 0.02 |
| 1823.3 | 0.021 |
| 1823.4 | 0.022 |
| 1823.5 | 0.022 |
| 1823.6 | 0.023 |
| 1823.7 | 0.021 |
| 1823.8 | 0.024 |
| 1823.9 | 0.02 |
| 1824.0 | 0.02 |
| 1824.1 | 0.023 |
| 1824.2 | 0.022 |
| 1824.3 | 0.018 |
| 1824.4 | 0.027 |
| 1824.5 | 0.029 |
| 1824.6 | 0.024 |
| 1824.7 | 0.023 |
| 1824.8 | 0.027 |
| 1824.9 | 0.027 |
| 1825.0 | 0.023 |
| 1825.1 | 0.011 |
| 1825.2 | 0.016 |
| 1825.3 | 0.013 |
| 1825.4 | 0.01 |
| 1825.5 | 0.011 |
| 1825.6 | 0.011 |
| 1825.7 | 0.011 |
| 1825.8 | 0.009 |
| 1825.9 | 0.01 |
| 1826.0 | 0.01 |
| 1826.1 | 0.013 |
| 1826.2 | 0.012 |
| 1826.3 | 0.013 |
| 1826.4 | 0.017 |
| 1826.5 | 0.021 |
| 1826.6 | 0.026 |
| 1826.7 | 0.027 |
| 1826.8 | 0.032 |
| 1826.9 | 0.032 |
| 1827.0 | 0.032 |
| 1827.1 | 0.035 |
| 1827.2 | 0.037 |
| 1827.3 | 0.029 |
| 1827.4 | 0.027 |
| 1827.5 | 0.025 |
| 1827.6 | 0.021 |
| 1827.7 | 0.016 |
| 1827.8 | 0.017 |
| 1827.9 | 0.017 |
| 1828.0 | 0.017 |
| 1828.1 | 0.012 |
| 1828.2 | 0.018 |
| 1828.3 | 0.019 |
| 1828.4 | 0.017 |
| 1828.5 | 0.019 |
| 1828.6 | 0.022 |
| 1828.7 | 0.018 |
| 1828.8 | 0.02 |
| 1828.9 | 0.023 |
| 1829.0 | 0.022 |
| 1829.1 | 0.025 |
| 1829.2 | 0.026 |
| 1829.3 | 0.024 |
| 1829.4 | 0.023 |
| 1829.5 | 0.028 |
| 1829.6 | 0.025 |
| 1829.7 | 0.027 |
| 1829.8 | 0.027 |
| 1829.9 | 0.029 |
| 1830.0 | 0.021 |
| 1830.1 | 0.022 |
| 1830.2 | 0.024 |
| 1830.3 | 0.024 |
| 1830.4 | 0.021 |
| 1830.5 | 0.028 |
| 1830.6 | 0.028 |
| 1830.7 | 0.024 |
| 1830.8 | 0.025 |
| 1830.9 | 0.024 |
| 1831.0 | 0.026 |
| 1831.1 | 0.029 |
| 1831.2 | 0.032 |
| 1831.3 | 0.035 |
| 1831.4 | 0.037 |
| 1831.5 | 0.036 |
| 1831.6 | 0.031 |
| 1831.7 | 0.036 |
| 1831.8 | 0.044 |
| 1831.9 | 0.048 |
| 1832.0 | 0.049 |
| 1832.1 | 0.053 |
| 1832.2 | 0.052 |
| 1832.3 | 0.045 |
| 1832.4 | 0.042 |
| 1832.5 | 0.048 |
| 1832.6 | 0.05 |
| 1832.7 | 0.051 |
| 1832.8 | 0.057 |
| 1832.9 | 0.063 |
| 1833.0 | 0.067 |
| 1833.1 | 0.076 |
| 1833.2 | 0.083 |
| 1833.3 | 0.094 |
| 1833.4 | 0.108 |
| 1833.5 | 0.113 |
| 1833.6 | 0.12 |
| 1833.7 | 0.135 |
| 1833.8 | 0.145 |
| 1833.9 | 0.155 |
| 1834.0 | 0.172 |
| 1834.1 | 0.19 |
| 1834.2 | 0.201 |
| 1834.3 | 0.209 |
| 1834.4 | 0.22 |
| 1834.5 | 0.225 |
| 1834.6 | 0.236 |
| 1834.7 | 0.241 |
| 1834.8 | 0.253 |
| 1834.9 | 0.257 |
| 1835.0 | 0.259 |
| 1835.1 | 0.257 |
| 1835.2 | 0.261 |
| 1835.3 | 0.252 |
| 1835.4 | 0.239 |
| 1835.5 | 0.229 |
| 1835.6 | 0.213 |
| 1835.7 | 0.192 |
| 1835.8 | 0.177 |
| 1835.9 | 0.162 |
| 1836.0 | 0.144 |
| 1836.1 | 0.131 |
| 1836.2 | 0.117 |
| 1836.3 | 0.104 |
| 1836.4 | 0.099 |
| 1836.5 | 0.097 |
| 1836.6 | 0.094 |
| 1836.7 | 0.095 |
| 1836.8 | 0.09 |
| 1836.9 | 0.089 |
| 1837.0 | 0.083 |
| 1837.1 | 0.075 |
| 1837.2 | 0.067 |
| 1837.3 | 0.061 |
| 1837.4 | 0.05 |
| 1837.5 | 0.046 |
| 1837.6 | 0.046 |
| 1837.7 | 0.04 |
| 1837.8 | 0.039 |
| 1837.9 | 0.043 |
| 1838.0 | 0.043 |
| 1838.1 | 0.047 |
| 1838.2 | 0.053 |
| 1838.3 | 0.061 |
| 1838.4 | 0.067 |
| 1838.5 | 0.068 |
| 1838.6 | 0.064 |
| 1838.7 | 0.065 |
| 1838.8 | 0.057 |
| 1838.9 | 0.048 |
| 1839.0 | 0.041 |
| 1839.1 | 0.033 |
| 1839.2 | 0.026 |
| 1839.3 | 0.023 |
| 1839.4 | 0.014 |
| 1839.5 | 0.009 |
| 1839.6 | 0.007 |
| 1839.7 | 0.004 |
| 1839.8 | 0.002 |
| 1839.9 | 0.006 |
| 1840.0 | 0.012 |
| 1840.1 | 0.017 |
| 1840.2 | 0.021 |
| 1840.3 | 0.032 |
| 1840.4 | 0.036 |
| 1840.5 | 0.044 |
| 1840.6 | 0.049 |
| 1840.7 | 0.054 |
| 1840.8 | 0.048 |
| 1840.9 | 0.047 |
| 1841.0 | 0.038 |
| 1841.1 | 0.035 |
| 1841.2 | 0.025 |
| 1841.3 | 0.022 |
| 1841.4 | 0.022 |
| 1841.5 | 0.015 |
| 1841.6 | 0.008 |
| 1841.7 | 0.006 |
| 1841.8 | 0.007 |
| 1841.9 | 0.003 |
| 1842.0 | 0.007 |
| 1842.1 | 0.012 |
| 1842.2 | 0.021 |
| 1842.3 | 0.026 |
| 1842.4 | 0.034 |
| 1842.5 | 0.05 |
| 1842.6 | 0.061 |
| 1842.7 | 0.066 |
| 1842.8 | 0.071 |
| 1842.9 | 0.079 |
| 1843.0 | 0.074 |
| 1843.1 | 0.077 |
| 1843.2 | 0.077 |
| 1843.3 | 0.068 |
| 1843.4 | 0.062 |
| 1843.5 | 0.054 |
| 1843.6 | 0.042 |
| 1843.7 | 0.036 |
| 1843.8 | 0.035 |
| 1843.9 | 0.033 |
| 1844.0 | 0.037 |
| 1844.1 | 0.015 |
| 1844.2 | 0.015 |
| 1844.3 | 0.017 |
| 1844.4 | 0.017 |
| 1844.5 | 0.016 |
| 1844.6 | 0.019 |
| 1844.7 | 0.016 |
| 1844.8 | 0.014 |
| 1844.9 | 0.016 |
| 1845.0 | 0.017 |
| 1845.1 | 0.013 |
| 1845.2 | 0.016 |
| 1845.3 | 0.021 |
| 1845.4 | 0.021 |
| 1845.5 | 0.025 |
| 1845.6 | 0.022 |
| 1845.7 | 0.022 |
| 1845.8 | 0.025 |
| 1845.9 | 0.027 |
| 1846.0 | 0.021 |
| 1846.1 | 0.024 |
| 1846.2 | 0.03 |
| 1846.3 | 0.028 |
| 1846.4 | 0.026 |
| 1846.5 | 0.034 |
| 1846.6 | 0.041 |
| 1846.7 | 0.04 |
| 1846.8 | 0.041 |
| 1846.9 | 0.045 |
| 1847.0 | 0.041 |
| 1847.1 | 0.037 |
| 1847.2 | 0.04 |
| 1847.3 | 0.047 |
| 1847.4 | 0.061 |
| 1847.5 | 0.079 |
| 1847.6 | 0.106 |
| 1847.7 | 0.128 |
| 1847.8 | 0.145 |
| 1847.9 | 0.159 |
| 1848.0 | 0.166 |
| 1848.1 | 0.164 |
| 1848.2 | 0.167 |
| 1848.3 | 0.17 |
| 1848.4 | 0.166 |
| 1848.5 | 0.168 |
| 1848.6 | 0.168 |
| 1848.7 | 0.163 |
| 1848.8 | 0.157 |
| 1848.9 | 0.152 |
| 1849.0 | 0.144 |
| 1849.1 | 0.138 |
| 1849.2 | 0.134 |
| 1849.3 | 0.134 |
| 1849.4 | 0.132 |
| 1849.5 | 0.134 |
| 1849.6 | 0.131 |
| 1849.7 | 0.124 |
| 1849.8 | 0.117 |
| 1849.9 | 0.11 |
| 1850.0 | 0.102 |
| 1850.1 | 0.089 |
| 1850.2 | 0.085 |
| 1850.3 | 0.082 |
| 1850.4 | 0.077 |
| 1850.5 | 0.077 |
| 1850.6 | 0.077 |
| 1850.7 | 0.083 |
| 1850.8 | 0.082 |
| 1850.9 | 0.091 |
| 1851.0 | 0.105 |
| 1851.1 | 0.116 |
| 1851.2 | 0.123 |
| 1851.3 | 0.136 |
| 1851.4 | 0.153 |
| 1851.5 | 0.153 |
| 1851.6 | 0.16 |
| 1851.7 | 0.167 |
| 1851.8 | 0.174 |
| 1851.9 | 0.172 |
| 1852.0 | 0.173 |
| 1852.1 | 0.17 |
| 1852.2 | 0.167 |
| 1852.3 | 0.163 |
| 1852.4 | 0.158 |
| 1852.5 | 0.152 |
| 1852.6 | 0.149 |
| 1852.7 | 0.144 |
| 1852.8 | 0.137 |
| 1852.9 | 0.133 |
| 1853.0 | 0.126 |
| 1853.1 | 0.123 |
| 1853.2 | 0.116 |
| 1853.3 | 0.113 |
| 1853.4 | 0.109 |
| 1853.5 | 0.111 |
| 1853.6 | 0.101 |
| 1853.7 | 0.093 |
| 1853.8 | 0.09 |
| 1853.9 | 0.085 |
| 1854.0 | 0.081 |
| 1854.1 | 0.091 |
| 1854.2 | 0.1 |
| 1854.3 | 0.103 |
| 1854.4 | 0.107 |
| 1854.5 | 0.114 |
| 1854.6 | 0.115 |
| 1854.7 | 0.124 |
| 1854.8 | 0.133 |
| 1854.9 | 0.14 |
| 1855.0 | 0.143 |
| 1855.1 | 0.135 |
| 1855.2 | 0.13 |
| 1855.3 | 0.129 |
| 1855.4 | 0.127 |
| 1855.5 | 0.123 |
| 1855.6 | 0.124 |
| 1855.7 | 0.123 |
| 1855.8 | 0.112 |
| 1855.9 | 0.103 |
| 1856.0 | 0.097 |
| 1856.1 | 0.09 |
| 1856.2 | 0.081 |
| 1856.3 | 0.079 |
| 1856.4 | 0.068 |
| 1856.5 | 0.063 |
| 1856.6 | 0.061 |
| 1856.7 | 0.056 |
| 1856.8 | 0.055 |
| 1856.9 | 0.063 |
| 1857.0 | 0.057 |
| 1857.1 | 0.055 |
| 1857.2 | 0.054 |
| 1857.3 | 0.049 |
| 1857.4 | 0.05 |
| 1857.5 | 0.05 |
| 1857.6 | 0.055 |
| 1857.7 | 0.056 |
| 1857.8 | 0.06 |
| 1857.9 | 0.062 |
| 1858.0 | 0.066 |
| 1858.1 | 0.065 |
| 1858.2 | 0.066 |
| 1858.3 | 0.062 |
| 1858.4 | 0.059 |
| 1858.5 | 0.052 |
| 1858.6 | 0.048 |
| 1858.7 | 0.045 |
| 1858.8 | 0.049 |
| 1858.9 | 0.049 |
| 1859.0 | 0.058 |
| 1859.1 | 0.058 |
| 1859.2 | 0.061 |
| 1859.3 | 0.058 |
| 1859.4 | 0.055 |
| 1859.5 | 0.052 |
| 1859.6 | 0.054 |
| 1859.7 | 0.051 |
| 1859.8 | 0.047 |
| 1859.9 | 0.05 |
| 1860.0 | 0.042 |
| 1860.1 | 0.038 |
| 1860.2 | 0.041 |
| 1860.3 | 0.043 |
| 1860.4 | 0.064 |
| 1860.5 | 0.087 |
| 1860.6 | 0.115 |
| 1860.7 | 0.136 |
| 1860.8 | 0.167 |
| 1860.9 | 0.176 |
| 1861.0 | 0.195 |
| 1861.1 | 0.214 |
| 1861.2 | 0.241 |
| 1861.3 | 0.267 |
| 1861.4 | 0.294 |
| 1861.5 | 0.326 |
| 1861.6 | 0.347 |
| 1861.7 | 0.373 |
| 1861.8 | 0.405 |
| 1861.9 | 0.44 |
| 1862.0 | 0.478 |
| 1862.1 | 0.518 |
| 1862.2 | 0.555 |
| 1862.3 | 0.581 |
| 1862.4 | 0.605 |
| 1862.5 | 0.621 |
| 1862.6 | 0.637 |
| 1862.7 | 0.653 |
| 1862.8 | 0.669 |
| 1862.9 | 0.68 |
| 1863.0 | 0.683 |
| 1863.1 | 0.692 |
| 1863.2 | 0.682 |
| 1863.3 | 0.683 |
| 1863.4 | 0.695 |
| 1863.5 | 0.715 |
| 1863.6 | 0.73 |
| 1863.7 | 0.759 |
| 1863.8 | 0.776 |
| 1863.9 | 0.795 |
| 1864.0 | 0.805 |
| 1864.1 | 0.825 |
| 1864.2 | 0.833 |
| 1864.3 | 0.841 |
| 1864.4 | 0.827 |
| 1864.5 | 0.82 |
| 1864.6 | 0.794 |
| 1864.7 | 0.78 |
| 1864.8 | 0.759 |
| 1864.9 | 0.748 |
| 1865.0 | 0.727 |
| 1865.1 | 0.705 |
| 1865.2 | 0.663 |
| 1865.3 | 0.638 |
| 1865.4 | 0.599 |
| 1865.5 | 0.566 |
| 1865.6 | 0.535 |
| 1865.7 | 0.511 |
| 1865.8 | 0.475 |
| 1865.9 | 0.445 |
| 1866.0 | 0.411 |
| 1866.1 | 0.382 |
| 1866.2 | 0.355 |
| 1866.3 | 0.333 |
| 1866.4 | 0.307 |
| 1866.5 | 0.293 |
| 1866.6 | 0.269 |
| 1866.7 | 0.255 |
| 1866.8 | 0.245 |
| 1866.9 | 0.234 |
| 1867.0 | 0.22 |
| 1867.1 | 0.215 |
| 1867.2 | 0.213 |
| 1867.3 | 0.201 |
| 1867.4 | 0.199 |
| 1867.5 | 0.193 |
| 1867.6 | 0.189 |
| 1867.7 | 0.18 |
| 1867.8 | 0.178 |
| 1867.9 | 0.184 |
| 1868.0 | 0.198 |
| 1868.1 | 0.212 |
| 1868.2 | 0.235 |
| 1868.3 | 0.261 |
| 1868.4 | 0.299 |
| 1868.5 | 0.337 |
| 1868.6 | 0.383 |
| 1868.7 | 0.423 |
| 1868.8 | 0.47 |
| 1868.9 | 0.488 |
| 1869.0 | 0.504 |
| 1869.1 | 0.507 |
| 1869.2 | 0.498 |
| 1869.3 | 0.469 |
| 1869.4 | 0.443 |
| 1869.5 | 0.412 |
| 1869.6 | 0.382 |
| 1869.7 | 0.349 |
| 1869.8 | 0.331 |
| 1869.9 | 0.313 |
| 1870.0 | 0.293 |
| 1870.1 | 0.285 |
| 1870.2 | 0.287 |
| 1870.3 | 0.283 |
| 1870.4 | 0.272 |
| 1870.5 | 0.264 |
| 1870.6 | 0.243 |
| 1870.7 | 0.227 |
| 1870.8 | 0.222 |
| 1870.9 | 0.216 |
| 1871.0 | 0.207 |
| 1871.1 | 0.212 |
| 1871.2 | 0.216 |
| 1871.3 | 0.218 |
| 1871.4 | 0.237 |
| 1871.5 | 0.269 |
| 1871.6 | 0.304 |
| 1871.7 | 0.336 |
| 1871.8 | 0.363 |
| 1871.9 | 0.375 |
| 1872.0 | 0.374 |
| 1872.1 | 0.357 |
| 1872.2 | 0.329 |
| 1872.3 | 0.3 |
| 1872.4 | 0.267 |
| 1872.5 | 0.234 |
| 1872.6 | 0.189 |
| 1872.7 | 0.155 |
| 1872.8 | 0.122 |
| 1872.9 | 0.088 |
| 1873.0 | 0.067 |
| 1873.1 | 0.062 |
| 1873.2 | 0.062 |
| 1873.3 | 0.064 |
| 1873.4 | 0.081 |
| 1873.5 | 0.103 |
| 1873.6 | 0.13 |
| 1873.7 | 0.153 |
| 1873.8 | 0.18 |
| 1873.9 | 0.199 |
| 1874.0 | 0.209 |
| 1874.1 | 0.213 |
| 1874.2 | 0.22 |
| 1874.3 | 0.222 |
| 1874.4 | 0.228 |
| 1874.5 | 0.228 |
| 1874.6 | 0.23 |
| 1874.7 | 0.23 |
| 1874.8 | 0.227 |
| 1874.9 | 0.225 |
| 1875.0 | 0.224 |
| 1875.1 | 0.225 |
| 1875.2 | 0.224 |
| 1875.3 | 0.231 |
| 1875.4 | 0.232 |
| 1875.5 | 0.239 |
| 1875.6 | 0.242 |
| 1875.7 | 0.25 |
| 1875.8 | 0.253 |
| 1875.9 | 0.26 |
| 1876.0 | 0.259 |
| 1876.1 | 0.26 |
| 1876.2 | 0.25 |
| 1876.3 | 0.238 |
| 1876.4 | 0.221 |
| 1876.5 | 0.218 |
| 1876.6 | 0.199 |
| 1876.7 | 0.188 |
| 1876.8 | 0.182 |
| 1876.9 | 0.187 |
| 1877.0 | 0.193 |
| 1877.1 | 0.224 |
| 1877.2 | 0.253 |
| 1877.3 | 0.284 |
| 1877.4 | 0.313 |
| 1877.5 | 0.336 |
| 1877.6 | 0.352 |
| 1877.7 | 0.378 |
| 1877.8 | 0.404 |
| 1877.9 | 0.426 |
| 1878.0 | 0.455 |
| 1878.1 | 0.487 |
| 1878.2 | 0.517 |
| 1878.3 | 0.554 |
| 1878.4 | 0.598 |
| 1878.5 | 0.647 |
| 1878.6 | 0.697 |
| 1878.7 | 0.752 |
| 1878.8 | 0.815 |
| 1878.9 | 0.897 |
| 1879.0 | 0.954 |
| 1879.1 | 1.025 |
| 1879.2 | 1.076 |
| 1879.3 | 1.109 |
| 1879.4 | 1.127 |
| 1879.5 | 1.144 |
| 1879.6 | 1.134 |
| 1879.7 | 1.126 |
| 1879.8 | 1.113 |
| 1879.9 | 1.072 |
| 1880.0 | 1.007 |
| 1880.1 | 0.951 |
| 1880.2 | 0.894 |
| 1880.3 | 0.835 |
| 1880.4 | 0.77 |
| 1880.5 | 0.73 |
| 1880.6 | 0.691 |
| 1880.7 | 0.653 |
| 1880.8 | 0.618 |
| 1880.9 | 0.595 |
| 1881.0 | 0.57 |
| 1881.1 | 0.543 |
| 1881.2 | 0.521 |
| 1881.3 | 0.503 |
| 1881.4 | 0.49 |
| 1881.5 | 0.477 |
| 1881.6 | 0.464 |
| 1881.7 | 0.455 |
| 1881.8 | 0.449 |
| 1881.9 | 0.45 |
| 1882.0 | 0.452 |
| 1882.1 | 0.466 |
| 1882.2 | 0.476 |
| 1882.3 | 0.484 |
| 1882.4 | 0.491 |
| 1882.5 | 0.513 |
| 1882.6 | 0.528 |
| 1882.7 | 0.548 |
| 1882.8 | 0.567 |
| 1882.9 | 0.583 |
| 1883.0 | 0.597 |
| 1883.1 | 0.606 |
| 1883.2 | 0.615 |
| 1883.3 | 0.614 |
| 1883.4 | 0.614 |
| 1883.5 | 0.604 |
| 1883.6 | 0.591 |
| 1883.7 | 0.559 |
| 1883.8 | 0.545 |
| 1883.9 | 0.52 |
| 1884.0 | 0.492 |
| 1884.1 | 0.455 |
| 1884.2 | 0.434 |
| 1884.3 | 0.405 |
| 1884.4 | 0.375 |
| 1884.5 | 0.345 |
| 1884.6 | 0.334 |
| 1884.7 | 0.318 |
| 1884.8 | 0.302 |
| 1884.9 | 0.299 |
| 1885.0 | 0.301 |
| 1885.1 | 0.295 |
| 1885.2 | 0.292 |
| 1885.3 | 0.299 |
| 1885.4 | 0.309 |
| 1885.5 | 0.313 |
| 1885.6 | 0.321 |
| 1885.7 | 0.339 |
| 1885.8 | 0.346 |
| 1885.9 | 0.351 |
| 1886.0 | 0.363 |
| 1886.1 | 0.371 |
| 1886.2 | 0.374 |
| 1886.3 | 0.387 |
| 1886.4 | 0.396 |
| 1886.5 | 0.402 |
| 1886.6 | 0.411 |
| 1886.7 | 0.421 |
| 1886.8 | 0.416 |
| 1886.9 | 0.412 |
| 1887.0 | 0.411 |
| 1887.1 | 0.406 |
| 1887.2 | 0.398 |
| 1887.3 | 0.392 |
| 1887.4 | 0.384 |
| 1887.5 | 0.371 |
| 1887.6 | 0.359 |
| 1887.7 | 0.341 |
| 1887.8 | 0.331 |
| 1887.9 | 0.322 |
| 1888.0 | 0.311 |
| 1888.1 | 0.307 |
| 1888.2 | 0.308 |
| 1888.3 | 0.299 |
| 1888.4 | 0.292 |
| 1888.5 | 0.286 |
| 1888.6 | 0.282 |
| 1888.7 | 0.272 |
| 1888.8 | 0.265 |
| 1888.9 | 0.26 |
| 1889.0 | 0.256 |
| 1889.1 | 0.252 |
| 1889.2 | 0.253 |
| 1889.3 | 0.26 |
| 1889.4 | 0.266 |
| 1889.5 | 0.274 |
| 1889.6 | 0.283 |
| 1889.7 | 0.292 |
| 1889.8 | 0.296 |
| 1889.9 | 0.293 |
| 1890.0 | 0.296 |
| 1890.1 | 0.286 |
| 1890.2 | 0.279 |
| 1890.3 | 0.279 |
| 1890.4 | 0.273 |
| 1890.5 | 0.258 |
| 1890.6 | 0.241 |
| 1890.7 | 0.222 |
| 1890.8 | 0.192 |
| 1890.9 | 0.175 |
| 1891.0 | 0.16 |
| 1891.1 | 0.159 |
| 1891.2 | 0.147 |
| 1891.3 | 0.144 |
| 1891.4 | 0.143 |
| 1891.5 | 0.139 |
| 1891.6 | 0.13 |
| 1891.7 | 0.135 |
| 1891.8 | 0.141 |
| 1891.9 | 0.145 |
| 1892.0 | 0.145 |
| 1892.1 | 0.148 |
| 1892.2 | 0.143 |
| 1892.3 | 0.134 |
| 1892.4 | 0.119 |
| 1892.5 | 0.105 |
| 1892.6 | 0.093 |
| 1892.7 | 0.084 |
| 1892.8 | 0.084 |
| 1892.9 | 0.085 |
| 1893.0 | 0.099 |
| 1893.1 | 0.109 |
| 1893.2 | 0.116 |
| 1893.3 | 0.126 |
| 1893.4 | 0.139 |
| 1893.5 | 0.143 |
| 1893.6 | 0.15 |
| 1893.7 | 0.156 |
| 1893.8 | 0.155 |
| 1893.9 | 0.16 |
| 1894.0 | 0.16 |
| 1894.1 | 0.165 |
| 1894.2 | 0.167 |
| 1894.3 | 0.165 |
| 1894.4 | 0.162 |
| 1894.5 | 0.159 |
| 1894.6 | 0.15 |
| 1894.7 | 0.143 |
| 1894.8 | 0.14 |
| 1894.9 | 0.127 |
| 1895.0 | 0.12 |
| 1895.1 | 0.11 |
| 1895.2 | 0.101 |
| 1895.3 | 0.089 |
| 1895.4 | 0.082 |
| 1895.5 | 0.076 |
| 1895.6 | 0.074 |
| 1895.7 | 0.07 |
| 1895.8 | 0.068 |
| 1895.9 | 0.07 |
| 1896.0 | 0.067 |
| 1896.1 | 0.057 |
| 1896.2 | 0.051 |
| 1896.3 | 0.048 |
| 1896.4 | 0.042 |
| 1896.5 | 0.036 |
| 1896.6 | 0.037 |
| 1896.7 | 0.038 |
| 1896.8 | 0.041 |
| 1896.9 | 0.04 |
| 1897.0 | 0.047 |
| 1897.1 | 0.057 |
| 1897.2 | 0.06 |
| 1897.3 | 0.062 |
| 1897.4 | 0.068 |
| 1897.5 | 0.076 |
| 1897.6 | 0.076 |
| 1897.7 | 0.086 |
| 1897.8 | 0.092 |
| 1897.9 | 0.094 |
| 1898.0 | 0.094 |
| 1898.1 | 0.095 |
| 1898.2 | 0.084 |
| 1898.3 | 0.085 |
| 1898.4 | 0.084 |
| 1898.5 | 0.079 |
| 1898.6 | 0.078 |
| 1898.7 | 0.083 |
| 1898.8 | 0.085 |
| 1898.9 | 0.085 |
| 1899.0 | 0.096 |
| 1899.1 | 0.111 |
| 1899.2 | 0.121 |
| 1899.3 | 0.134 |
| 1899.4 | 0.155 |
| 1899.5 | 0.168 |
| 1899.6 | 0.182 |
| 1899.7 | 0.205 |
| 1899.8 | 0.22 |
| 1899.9 | 0.238 |
| 1900.0 | 0.248 |
| 1900.1 | 0.261 |
| 1900.2 | 0.264 |
| 1900.3 | 0.272 |
| 1900.4 | 0.277 |
| 1900.5 | 0.285 |
| 1900.6 | 0.29 |
| 1900.7 | 0.298 |
| 1900.8 | 0.297 |
| 1900.9 | 0.302 |
| 1901.0 | 0.301 |
| 1901.1 | 0.286 |
| 1901.2 | 0.278 |
| 1901.3 | 0.275 |
| 1901.4 | 0.26 |
| 1901.5 | 0.245 |
| 1901.6 | 0.237 |
| 1901.7 | 0.228 |
| 1901.8 | 0.203 |
| 1901.9 | 0.183 |
| 1902.0 | 0.176 |
| 1902.1 | 0.161 |
| 1902.2 | 0.145 |
| 1902.3 | 0.142 |
| 1902.4 | 0.137 |
| 1902.5 | 0.127 |
| 1902.6 | 0.132 |
| 1902.7 | 0.141 |
| 1902.8 | 0.147 |
| 1902.9 | 0.159 |
| 1903.0 | 0.175 |
| 1903.1 | 0.192 |
| 1903.2 | 0.204 |
| 1903.3 | 0.217 |
| 1903.4 | 0.226 |
| 1903.5 | 0.233 |
| 1903.6 | 0.235 |
| 1903.7 | 0.234 |
| 1903.8 | 0.24 |
| 1903.9 | 0.243 |
| 1904.0 | 0.248 |
| 1904.1 | 0.254 |
| 1904.2 | 0.271 |
| 1904.3 | 0.28 |
| 1904.4 | 0.299 |
| 1904.5 | 0.321 |
| 1904.6 | 0.335 |
| 1904.7 | 0.36 |
| 1904.8 | 0.391 |
| 1904.9 | 0.434 |
| 1905.0 | 0.47 |
| 1905.1 | 0.526 |
| 1905.2 | 0.595 |
| 1905.3 | 0.664 |
| 1905.4 | 0.726 |
| 1905.5 | 0.799 |
| 1905.6 | 0.862 |
| 1905.7 | 0.908 |
| 1905.8 | 0.944 |
| 1905.9 | 0.974 |
| 1906.0 | 1 |
| 1906.1 | 1.025 |
| 1906.2 | 1.034 |
| 1906.3 | 1.056 |
| 1906.4 | 1.079 |
| 1906.5 | 1.108 |
| 1906.6 | 1.137 |
| 1906.7 | 1.172 |
| 1906.8 | 1.204 |
| 1906.9 | 1.232 |
| 1907.0 | 1.241 |
| 1907.1 | 1.255 |
| 1907.2 | 1.258 |
| 1907.3 | 1.259 |
| 1907.4 | 1.246 |
| 1907.5 | 1.228 |
| 1907.6 | 1.219 |
| 1907.7 | 1.188 |
| 1907.8 | 1.159 |
| 1907.9 | 1.133 |
| 1908.0 | 1.099 |
| 1908.1 | 1.057 |
| 1908.2 | 1.029 |
| 1908.3 | 0.994 |
| 1908.4 | 0.958 |
| 1908.5 | 0.944 |
| 1908.6 | 0.924 |
| 1908.7 | 0.915 |
| 1908.8 | 0.898 |
| 1908.9 | 0.893 |
| 1909.0 | 0.87 |
| 1909.1 | 0.846 |
| 1909.2 | 0.81 |
| 1909.3 | 0.789 |
| 1909.4 | 0.757 |
| 1909.5 | 0.728 |
| 1909.6 | 0.705 |
| 1909.7 | 0.678 |
| 1909.8 | 0.642 |
| 1909.9 | 0.604 |
| 1910.0 | 0.573 |
| 1910.1 | 0.54 |
| 1910.2 | 0.51 |
| 1910.3 | 0.49 |
| 1910.4 | 0.481 |
| 1910.5 | 0.463 |
| 1910.6 | 0.457 |
| 1910.7 | 0.444 |
| 1910.8 | 0.432 |
| 1910.9 | 0.423 |
| 1911.0 | 0.415 |
| 1911.1 | 0.405 |
| 1911.2 | 0.401 |
| 1911.3 | 0.406 |
| 1911.4 | 0.411 |
| 1911.5 | 0.421 |
| 1911.6 | 0.426 |
| 1911.7 | 0.434 |
| 1911.8 | 0.432 |
| 1911.9 | 0.431 |
| 1912.0 | 0.434 |
| 1912.1 | 0.435 |
| 1912.2 | 0.431 |
| 1912.3 | 0.428 |
| 1912.4 | 0.425 |
| 1912.5 | 0.422 |
| 1912.6 | 0.422 |
| 1912.7 | 0.432 |
| 1912.8 | 0.437 |
| 1912.9 | 0.446 |
| 1913.0 | 0.455 |
| 1913.1 | 0.473 |
| 1913.2 | 0.487 |
| 1913.3 | 0.497 |
| 1913.4 | 0.509 |
| 1913.5 | 0.53 |
| 1913.6 | 0.536 |
| 1913.7 | 0.555 |
| 1913.8 | 0.579 |
| 1913.9 | 0.594 |
| 1914.0 | 0.608 |
| 1914.1 | 0.615 |
| 1914.2 | 0.604 |
| 1914.3 | 0.594 |
| 1914.4 | 0.577 |
| 1914.5 | 0.545 |
| 1914.6 | 0.519 |
| 1914.7 | 0.492 |
| 1914.8 | 0.461 |
| 1914.9 | 0.424 |
| 1915.0 | 0.395 |
| 1915.1 | 0.351 |
| 1915.2 | 0.319 |
| 1915.3 | 0.285 |
| 1915.4 | 0.253 |
| 1915.5 | 0.231 |
| 1915.6 | 0.22 |
| 1915.7 | 0.208 |
| 1915.8 | 0.192 |
| 1915.9 | 0.183 |
| 1916.0 | 0.169 |
| 1916.1 | 0.163 |
| 1916.2 | 0.155 |
| 1916.3 | 0.161 |
| 1916.4 | 0.173 |
| 1916.5 | 0.174 |
| 1916.6 | 0.177 |
| 1916.7 | 0.186 |
| 1916.8 | 0.193 |
| 1916.9 | 0.195 |
| 1917.0 | 0.212 |
| 1917.1 | 0.225 |
| 1917.2 | 0.238 |
| 1917.3 | 0.246 |
| 1917.4 | 0.258 |
| 1917.5 | 0.261 |
| 1917.6 | 0.261 |
| 1917.7 | 0.27 |
| 1917.8 | 0.283 |
| 1917.9 | 0.298 |
| 1918.0 | 0.312 |
| 1918.1 | 0.344 |
| 1918.2 | 0.366 |
| 1918.3 | 0.39 |
| 1918.4 | 0.413 |
| 1918.5 | 0.443 |
| 1918.6 | 0.472 |
| 1918.7 | 0.489 |
| 1918.8 | 0.506 |
| 1918.9 | 0.527 |
| 1919.0 | 0.539 |
| 1919.1 | 0.533 |
| 1919.2 | 0.543 |
| 1919.3 | 0.545 |
| 1919.4 | 0.542 |
| 1919.5 | 0.556 |
| 1919.6 | 0.563 |
| 1919.7 | 0.564 |
| 1919.8 | 0.565 |
| 1919.9 | 0.555 |
| 1920.0 | 0.535 |
| 1920.1 | 0.526 |
| 1920.2 | 0.512 |
| 1920.3 | 0.487 |
| 1920.4 | 0.484 |
| 1920.5 | 0.468 |
| 1920.6 | 0.455 |
| 1920.7 | 0.441 |
| 1920.8 | 0.441 |
| 1920.9 | 0.421 |
| 1921.0 | 0.415 |
| 1921.1 | 0.405 |
| 1921.2 | 0.384 |
| 1921.3 | 0.373 |
| 1921.4 | 0.362 |
| 1921.5 | 0.346 |
| 1921.6 | 0.323 |
| 1921.7 | 0.31 |
| 1921.8 | 0.285 |
| 1921.9 | 0.265 |
| 1922.0 | 0.245 |
| 1922.1 | 0.23 |
| 1922.2 | 0.22 |
| 1922.3 | 0.214 |
| 1922.4 | 0.209 |
| 1922.5 | 0.2 |
| 1922.6 | 0.198 |
| 1922.7 | 0.191 |
| 1922.8 | 0.189 |
| 1922.9 | 0.179 |
| 1923.0 | 0.188 |
| 1923.1 | 0.187 |
| 1923.2 | 0.191 |
| 1923.3 | 0.182 |
| 1923.4 | 0.183 |
| 1923.5 | 0.179 |
| 1923.6 | 0.18 |
| 1923.7 | 0.181 |
| 1923.8 | 0.19 |
| 1923.9 | 0.198 |
| 1924.0 | 0.198 |
| 1924.1 | 0.21 |
| 1924.2 | 0.219 |
| 1924.3 | 0.236 |
| 1924.4 | 0.262 |
| 1924.5 | 0.286 |
| 1924.6 | 0.298 |
| 1924.7 | 0.323 |
| 1924.8 | 0.338 |
| 1924.9 | 0.347 |
| 1925.0 | 0.359 |
| 1925.1 | 0.368 |
| 1925.2 | 0.372 |
| 1925.3 | 0.382 |
| 1925.4 | 0.387 |
| 1925.5 | 0.386 |
| 1925.6 | 0.39 |
| 1925.7 | 0.393 |
| 1925.8 | 0.391 |
| 1925.9 | 0.388 |
| 1926.0 | 0.387 |
| 1926.1 | 0.38 |
| 1926.2 | 0.371 |
| 1926.3 | 0.369 |
| 1926.4 | 0.358 |
| 1926.5 | 0.352 |
| 1926.6 | 0.352 |
| 1926.7 | 0.351 |
| 1926.8 | 0.346 |
| 1926.9 | 0.352 |
| 1927.0 | 0.356 |
| 1927.1 | 0.373 |
| 1927.2 | 0.392 |
| 1927.3 | 0.411 |
| 1927.4 | 0.429 |
| 1927.5 | 0.453 |
| 1927.6 | 0.477 |
| 1927.7 | 0.496 |
| 1927.8 | 0.515 |
| 1927.9 | 0.543 |
| 1928.0 | 0.562 |
| 1928.1 | 0.565 |
| 1928.2 | 0.569 |
| 1928.3 | 0.577 |
| 1928.4 | 0.575 |
| 1928.5 | 0.564 |
| 1928.6 | 0.563 |
| 1928.7 | 0.556 |
| 1928.8 | 0.543 |
| 1928.9 | 0.524 |
| 1929.0 | 0.517 |
| 1929.1 | 0.494 |
| 1929.2 | 0.466 |
| 1929.3 | 0.448 |
| 1929.4 | 0.424 |
| 1929.5 | 0.393 |
| 1929.6 | 0.372 |
| 1929.7 | 0.361 |
| 1929.8 | 0.334 |
| 1929.9 | 0.325 |
| 1930.0 | 0.32 |
| 1930.1 | 0.307 |
| 1930.2 | 0.297 |
| 1930.3 | 0.298 |
| 1930.4 | 0.294 |
| 1930.5 | 0.294 |
| 1930.6 | 0.299 |
| 1930.7 | 0.307 |
| 1930.8 | 0.321 |
| 1930.9 | 0.339 |
| 1931.0 | 0.364 |
| 1931.1 | 0.389 |
| 1931.2 | 0.418 |
| 1931.3 | 0.45 |
| 1931.4 | 0.479 |
| 1931.5 | 0.506 |
| 1931.6 | 0.539 |
| 1931.7 | 0.581 |
| 1931.8 | 0.603 |
| 1931.9 | 0.629 |
| 1932.0 | 0.651 |
| 1932.1 | 0.667 |
| 1932.2 | 0.673 |
| 1932.3 | 0.687 |
| 1932.4 | 0.686 |
| 1932.5 | 0.688 |
| 1932.6 | 0.677 |
| 1932.7 | 0.652 |
| 1932.8 | 0.618 |
| 1932.9 | 0.583 |
| 1933.0 | 0.542 |
| 1933.1 | 0.499 |
| 1933.2 | 0.464 |
| 1933.3 | 0.419 |
| 1933.4 | 0.385 |
| 1933.5 | 0.352 |
| 1933.6 | 0.328 |
| 1933.7 | 0.296 |
| 1933.8 | 0.276 |
| 1933.9 | 0.265 |
| 1934.0 | 0.236 |
| 1934.1 | 0.215 |
| 1934.2 | 0.203 |
| 1934.3 | 0.19 |
| 1934.4 | 0.174 |
| 1934.5 | 0.174 |
| 1934.6 | 0.171 |
| 1934.7 | 0.17 |
| 1934.8 | 0.172 |
| 1934.9 | 0.166 |
| 1935.0 | 0.167 |
| 1935.1 | 0.165 |
| 1935.2 | 0.165 |
| 1935.3 | 0.165 |
| 1935.4 | 0.172 |
| 1935.5 | 0.18 |
| 1935.6 | 0.187 |
| 1935.7 | 0.196 |
| 1935.8 | 0.213 |
| 1935.9 | 0.23 |
| 1936.0 | 0.238 |
| 1936.1 | 0.257 |
| 1936.2 | 0.269 |
| 1936.3 | 0.273 |
| 1936.4 | 0.277 |
| 1936.5 | 0.292 |
| 1936.6 | 0.293 |
| 1936.7 | 0.292 |
| 1936.8 | 0.304 |
| 1936.9 | 0.305 |
| 1937.0 | 0.3 |
| 1937.1 | 0.296 |
| 1937.2 | 0.294 |
| 1937.3 | 0.278 |
| 1937.4 | 0.264 |
| 1937.5 | 0.247 |
| 1937.6 | 0.234 |
| 1937.7 | 0.226 |
| 1937.8 | 0.216 |
| 1937.9 | 0.212 |
| 1938.0 | 0.207 |
| 1938.1 | 0.203 |
| 1938.2 | 0.2 |
| 1938.3 | 0.207 |
| 1938.4 | 0.206 |
| 1938.5 | 0.22 |
| 1938.6 | 0.232 |
| 1938.7 | 0.247 |
| 1938.8 | 0.248 |
| 1938.9 | 0.267 |
| 1939.0 | 0.279 |
| 1939.1 | 0.292 |
| 1939.2 | 0.302 |
| 1939.3 | 0.324 |
| 1939.4 | 0.334 |
| 1939.5 | 0.338 |
| 1939.6 | 0.35 |
| 1939.7 | 0.364 |
| 1939.8 | 0.368 |
| 1939.9 | 0.373 |
| 1940.0 | 0.384 |
| 1940.1 | 0.385 |
| 1940.2 | 0.378 |
| 1940.3 | 0.371 |
| 1940.4 | 0.367 |
| 1940.5 | 0.351 |
| 1940.6 | 0.334 |
| 1940.7 | 0.32 |
| 1940.8 | 0.304 |
| 1940.9 | 0.285 |
| 1941.0 | 0.269 |
| 1941.1 | 0.252 |
| 1941.2 | 0.238 |
| 1941.3 | 0.224 |
| 1941.4 | 0.21 |
| 1941.5 | 0.197 |
| 1941.6 | 0.188 |
| 1941.7 | 0.173 |
| 1941.8 | 0.164 |
| 1941.9 | 0.157 |
| 1942.0 | 0.157 |
| 1942.1 | 0.152 |
| 1942.2 | 0.155 |
| 1942.3 | 0.158 |
| 1942.4 | 0.163 |
| 1942.5 | 0.162 |
| 1942.6 | 0.165 |
| 1942.7 | 0.164 |
| 1942.8 | 0.167 |
| 1942.9 | 0.163 |
| 1943.0 | 0.168 |
| 1943.1 | 0.167 |
| 1943.2 | 0.172 |
| 1943.3 | 0.174 |
| 1943.4 | 0.175 |
| 1943.5 | 0.17 |
| 1943.6 | 0.168 |
| 1943.7 | 0.155 |
| 1943.8 | 0.148 |
| 1943.9 | 0.137 |
| 1944.0 | 0.129 |
| 1944.1 | 0.125 |
| 1944.2 | 0.129 |
| 1944.3 | 0.122 |
| 1944.4 | 0.122 |
| 1944.5 | 0.121 |
| 1944.6 | 0.117 |
| 1944.7 | 0.114 |
| 1944.8 | 0.11 |
| 1944.9 | 0.114 |
| 1945.0 | 0.111 |
| 1945.1 | 0.113 |
| 1945.2 | 0.11 |
| 1945.3 | 0.124 |
| 1945.4 | 0.124 |
| 1945.5 | 0.135 |
| 1945.6 | 0.147 |
| 1945.7 | 0.165 |
| 1945.8 | 0.172 |
| 1945.9 | 0.19 |
| 1946.0 | 0.196 |
| 1946.1 | 0.194 |
| 1946.2 | 0.197 |
| 1946.3 | 0.195 |
| 1946.4 | 0.2 |
| 1946.5 | 0.206 |
| 1946.6 | 0.22 |
| 1946.7 | 0.222 |
| 1946.8 | 0.224 |
| 1946.9 | 0.213 |
| 1947.0 | 0.208 |
| 1947.1 | 0.202 |
| 1947.2 | 0.199 |
| 1947.3 | 0.199 |
| 1947.4 | 0.195 |
| 1947.5 | 0.192 |
| 1947.6 | 0.178 |
| 1947.7 | 0.16 |
| 1947.8 | 0.144 |
| 1947.9 | 0.133 |
| 1948.0 | 0.12 |
| 1948.1 | 0.112 |
| 1948.2 | 0.104 |
| 1948.3 | 0.1 |
| 1948.4 | 0.093 |
| 1948.5 | 0.082 |
| 1948.6 | 0.07 |
| 1948.7 | 0.068 |
| 1948.8 | 0.061 |
| 1948.9 | 0.05 |
| 1949.0 | 0.048 |
| 1949.1 | 0.048 |
| 1949.2 | 0.04 |
| 1949.3 | 0.038 |
| 1949.4 | 0.039 |
| 1949.5 | 0.039 |
| 1949.6 | 0.035 |
| 1949.7 | 0.034 |
| 1949.8 | 0.032 |
| 1949.9 | 0.028 |
| 1950.0 | 0.045 |
| 1950.1 | 0.042 |
| 1950.2 | 0.041 |
| 1950.3 | 0.039 |
| 1950.4 | 0.039 |
| 1950.5 | 0.04 |
| 1950.6 | 0.038 |
| 1950.7 | 0.036 |
| 1950.8 | 0.034 |
| 1950.9 | 0.033 |
| 1951.0 | 0.029 |
| 1951.1 | 0.032 |
| 1951.2 | 0.025 |
| 1951.3 | 0.022 |
| 1951.4 | 0.024 |
| 1951.5 | 0.026 |
| 1951.6 | 0.026 |
| 1951.7 | 0.027 |
| 1951.8 | 0.03 |
| 1951.9 | 0.026 |
| 1952.0 | 0.022 |
| 1952.1 | 0.019 |
| 1952.2 | 0.017 |
| 1952.3 | 0.017 |
| 1952.4 | 0.016 |
| 1952.5 | 0.018 |
| 1952.6 | 0.012 |
| 1952.7 | 0.016 |
| 1952.8 | 0.015 |
| 1952.9 | 0.015 |
| 1953.0 | 0.012 |
| 1953.1 | 0.017 |
| 1953.2 | 0.01 |
| 1953.3 | 0.009 |
| 1953.4 | 0.016 |
| 1953.5 | 0.017 |
| 1953.6 | 0.014 |
| 1953.7 | 0.021 |
| 1953.8 | 0.019 |
| 1953.9 | 0.01 |
| 1954.0 | 0.012 |
| 1954.1 | 0.016 |
| 1954.2 | 0.017 |
| 1954.3 | 0.024 |
| 1954.4 | 0.029 |
| 1954.5 | 0.027 |
| 1954.6 | 0.028 |
| 1954.7 | 0.034 |
| 1954.8 | 0.028 |
| 1954.9 | 0.03 |
| 1955.0 | 0.034 |
| 1955.1 | 0.028 |
| 1955.2 | 0.018 |
| 1955.3 | 0.021 |
| 1955.4 | 0.014 |
| 1955.5 | 0.015 |
| 1955.6 | 0.021 |
| 1955.7 | 0.02 |
| 1955.8 | 0.023 |
| 1955.9 | 0.022 |
| 1956.0 | 0.017 |
| 1956.1 | 0.015 |
| 1956.2 | 0.022 |
| 1956.3 | 0.024 |
| 1956.4 | 0.026 |
| 1956.5 | 0.023 |
| 1956.6 | 0.023 |
| 1956.7 | 0.022 |
| 1956.8 | 0.017 |
| 1956.9 | 0.02 |
| 1957.0 | 0.023 |
| 1957.1 | 0.019 |
| 1957.2 | 0.02 |
| 1957.3 | 0.017 |
| 1957.4 | 0.015 |
| 1957.5 | 0.017 |
| 1957.6 | 0.023 |
| 1957.7 | 0.02 |
| 1957.8 | 0.02 |
| 1957.9 | 0.019 |
| 1958.0 | 0.017 |
| 1958.1 | 0.015 |
| 1958.2 | 0.024 |
| 1958.3 | 0.029 |
| 1958.4 | 0.033 |
| 1958.5 | 0.04 |
| 1958.6 | 0.041 |
| 1958.7 | 0.039 |
| 1958.8 | 0.042 |
| 1958.9 | 0.043 |
| 1959.0 | 0.039 |
| 1959.1 | 0.04 |
| 1959.2 | 0.039 |
| 1959.3 | 0.041 |
| 1959.4 | 0.041 |
| 1959.5 | 0.043 |
| 1959.6 | 0.044 |
| 1959.7 | 0.043 |
| 1959.8 | 0.042 |
| 1959.9 | 0.044 |
| 1960.0 | 0.043 |
| 1960.1 | 0.051 |
| 1960.2 | 0.053 |
| 1960.3 | 0.053 |
| 1960.4 | 0.054 |
| 1960.5 | 0.057 |
| 1960.6 | 0.054 |
| 1960.7 | 0.046 |
| 1960.8 | 0.05 |
| 1960.9 | 0.049 |
| 1961.0 | 0.052 |
| 1961.1 | 0.052 |
| 1961.2 | 0.06 |
| 1961.3 | 0.054 |
| 1961.4 | 0.056 |
| 1961.5 | 0.054 |
| 1961.6 | 0.047 |
| 1961.7 | 0.047 |
| 1961.8 | 0.044 |
| 1961.9 | 0.037 |
| 1962.0 | 0.031 |
| 1962.1 | 0.037 |
| 1962.2 | 0.044 |
| 1962.3 | 0.052 |
| 1962.4 | 0.059 |
| 1962.5 | 0.066 |
| 1962.6 | 0.06 |
| 1962.7 | 0.054 |
| 1962.8 | 0.048 |
| 1962.9 | 0.046 |
| 1963.0 | 0.041 |
| 1963.1 | 0.041 |
| 1963.2 | 0.044 |
| 1963.3 | 0.046 |
| 1963.4 | 0.046 |
| 1963.5 | 0.051 |
| 1963.6 | 0.052 |
| 1963.7 | 0.052 |
| 1963.8 | 0.048 |
| 1963.9 | 0.044 |
| 1964.0 | 0.041 |
| 1964.1 | 0.045 |
| 1964.2 | 0.042 |
| 1964.3 | 0.046 |
| 1964.4 | 0.05 |
| 1964.5 | 0.055 |
| 1964.6 | 0.058 |
| 1964.7 | 0.069 |
| 1964.8 | 0.072 |
| 1964.9 | 0.073 |
| 1965.0 | 0.071 |
| 1965.1 | 0.074 |
| 1965.2 | 0.064 |
| 1965.3 | 0.066 |
| 1965.4 | 0.074 |
| 1965.5 | 0.08 |
| 1965.6 | 0.088 |
| 1965.7 | 0.1 |
| 1965.8 | 0.108 |
| 1965.9 | 0.108 |
| 1966.0 | 0.116 |
| 1966.1 | 0.12 |
| 1966.2 | 0.125 |
| 1966.3 | 0.13 |
| 1966.4 | 0.14 |
| 1966.5 | 0.14 |
| 1966.6 | 0.143 |
| 1966.7 | 0.147 |
| 1966.8 | 0.146 |
| 1966.9 | 0.142 |
| 1967.0 | 0.143 |
| 1967.1 | 0.135 |
| 1967.2 | 0.135 |
| 1967.3 | 0.13 |
| 1967.4 | 0.133 |
| 1967.5 | 0.136 |
| 1967.6 | 0.143 |
| 1967.7 | 0.137 |
| 1967.8 | 0.146 |
| 1967.9 | 0.137 |
| 1968.0 | 0.135 |
| 1968.1 | 0.128 |
| 1968.2 | 0.125 |
| 1968.3 | 0.123 |
| 1968.4 | 0.123 |
| 1968.5 | 0.12 |
| 1968.6 | 0.124 |
| 1968.7 | 0.125 |
| 1968.8 | 0.121 |
| 1968.9 | 0.12 |
| 1969.0 | 0.122 |
| 1969.1 | 0.116 |
| 1969.2 | 0.112 |
| 1969.3 | 0.105 |
| 1969.4 | 0.1 |
| 1969.5 | 0.08 |
| 1969.6 | 0.074 |
| 1969.7 | 0.075 |
| 1969.8 | 0.065 |
| 1969.9 | 0.061 |
| 1970.0 | 0.062 |
| 1970.1 | 0.063 |
| 1970.2 | 0.049 |
| 1970.3 | 0.049 |
| 1970.4 | 0.045 |
| 1970.5 | 0.052 |
| 1970.6 | 0.047 |
| 1970.7 | 0.05 |
| 1970.8 | 0.049 |
| 1970.9 | 0.051 |
| 1971.0 | 0.048 |
| 1971.1 | 0.044 |
| 1971.2 | 0.045 |
| 1971.3 | 0.051 |
| 1971.4 | 0.055 |
| 1971.5 | 0.058 |
| 1971.6 | 0.067 |
| 1971.7 | 0.071 |
| 1971.8 | 0.067 |
| 1971.9 | 0.065 |
| 1972.0 | 0.062 |
| 1972.1 | 0.06 |
| 1972.2 | 0.062 |
| 1972.3 | 0.074 |
| 1972.4 | 0.081 |
| 1972.5 | 0.095 |
| 1972.6 | 0.108 |
| 1972.7 | 0.121 |
| 1972.8 | 0.13 |
| 1972.9 | 0.146 |
| 1973.0 | 0.153 |
| 1973.1 | 0.164 |
| 1973.2 | 0.176 |
| 1973.3 | 0.185 |
| 1973.4 | 0.19 |
| 1973.5 | 0.199 |
| 1973.6 | 0.197 |
| 1973.7 | 0.19 |
| 1973.8 | 0.185 |
| 1973.9 | 0.179 |
| 1974.0 | 0.17 |
| 1974.1 | 0.167 |
| 1974.2 | 0.165 |
| 1974.3 | 0.155 |
| 1974.4 | 0.15 |
| 1974.5 | 0.149 |
| 1974.6 | 0.143 |
| 1974.7 | 0.129 |
| 1974.8 | 0.122 |
| 1974.9 | 0.112 |
| 1975.0 | 0.092 |
| 1975.1 | 0.082 |
| 1975.2 | 0.072 |
| 1975.3 | 0.065 |
| 1975.4 | 0.054 |
| 1975.5 | 0.059 |
| 1975.6 | 0.051 |
| 1975.7 | 0.052 |
| 1975.8 | 0.052 |
| 1975.9 | 0.051 |
| 1976.0 | 0.046 |
| 1976.1 | 0.042 |
| 1976.2 | 0.045 |
| 1976.3 | 0.04 |
| 1976.4 | 0.038 |
| 1976.5 | 0.034 |
| 1976.6 | 0.037 |
| 1976.7 | 0.024 |
| 1976.8 | 0.023 |
| 1976.9 | 0.02 |
| 1977.0 | 0.024 |
| 1977.1 | 0.022 |
| 1977.2 | 0.03 |
| 1977.3 | 0.027 |
| 1977.4 | 0.03 |
| 1977.5 | 0.024 |
| 1977.6 | 0.025 |
| 1977.7 | 0.021 |
| 1977.8 | 0.023 |
| 1977.9 | 0.018 |
| 1978.0 | 0.021 |
| 1978.1 | 0.02 |
| 1978.2 | 0.022 |
| 1978.3 | 0.022 |
| 1978.4 | 0.022 |
| 1978.5 | 0.018 |
| 1978.6 | 0.017 |
| 1978.7 | 0.014 |
| 1978.8 | 0.013 |
| 1978.9 | 0.013 |
| 1979.0 | 0.012 |
| 1979.1 | 0.01 |
| 1979.2 | 0.006 |
| 1979.3 | 0.016 |
| 1979.4 | 0.018 |
| 1979.5 | 0.019 |
| 1979.6 | 0.014 |
| 1979.7 | 0.023 |
| 1979.8 | 0.015 |
| 1979.9 | 0.02 |
| 1980.0 | 0.024 |
| 1980.1 | 0.026 |
| 1980.2 | 0.021 |
| 1980.3 | 0.019 |
| 1980.4 | 0.014 |
| 1980.5 | 0.013 |
| 1980.6 | 0.014 |
| 1980.7 | 0.02 |
| 1980.8 | 0.024 |
| 1980.9 | 0.025 |
| 1981.0 | 0.031 |
| 1981.1 | 0.033 |
| 1981.2 | 0.026 |
| 1981.3 | 0.023 |
| 1981.4 | 0.02 |
| 1981.5 | 0.014 |
| 1981.6 | 0.011 |
| 1981.7 | 0.012 |
| 1981.8 | 0.008 |
| 1981.9 | 0.012 |
| 1982.0 | 0.007 |
| 1982.1 | 0.008 |
| 1982.2 | 0.01 |
| 1982.3 | 0.019 |
| 1982.4 | 0.019 |
| 1982.5 | 0.019 |
| 1982.6 | 0.026 |
| 1982.7 | 0.031 |
| 1982.8 | 0.03 |
| 1982.9 | 0.03 |
| 1983.0 | 0.036 |
| 1983.1 | 0.032 |
| 1983.2 | 0.026 |
| 1983.3 | 0.021 |
| 1983.4 | 0.019 |
| 1983.5 | 0.015 |
| 1983.6 | 0.013 |
| 1983.7 | 0.012 |
| 1983.8 | 0.018 |
| 1983.9 | 0.012 |
| 1984.0 | 0.017 |
| 1984.1 | 0.013 |
| 1984.2 | 0.017 |
| 1984.3 | 0.012 |
| 1984.4 | 0.011 |
| 1984.5 | 0.013 |
| 1984.6 | 0.021 |
| 1984.7 | 0.018 |
| 1984.8 | 0.02 |
| 1984.9 | 0.021 |
| 1985.0 | 0.018 |
| 1985.1 | 0.013 |
| 1985.2 | 0.017 |
| 1985.3 | 0.02 |
| 1985.4 | 0.027 |
| 1985.5 | 0.028 |
| 1985.6 | 0.032 |
| 1985.7 | 0.023 |
| 1985.8 | 0.018 |
| 1985.9 | 0.02 |
| 1986.0 | 0.012 |
| 1986.1 | 0.001 |
| 1986.2 | 0.007 |
| 1986.3 | 0.007 |
| 1986.4 | 0.006 |
| 1986.5 | 0.016 |
| 1986.6 | 0.027 |
| 1986.7 | 0.025 |
| 1986.8 | 0.027 |
| 1986.9 | 0.026 |
| 1987.0 | 0.016 |
| 1987.1 | 0.016 |
| 1987.2 | 0.009 |
| 1987.3 | 0.011 |
| 1987.4 | 0.008 |
| 1987.5 | 0.014 |
| 1987.6 | 0.012 |
| 1987.7 | 0.016 |
| 1987.8 | 0.014 |
| 1987.9 | 0.015 |
| 1988.0 | 0.015 |
| 1988.1 | 0.009 |
| 1988.2 | 0.017 |
| 1988.3 | 0.015 |
| 1988.4 | 0.014 |
| 1988.5 | 0.011 |
| 1988.6 | 0.024 |
| 1988.7 | 0.018 |
| 1988.8 | 0.026 |
| 1988.9 | 0.03 |
| 1989.0 | 0.03 |
| 1989.1 | 0.023 |
| 1989.2 | 0.021 |
| 1989.3 | 0.017 |
| 1989.4 | 0.017 |
| 1989.5 | 0.02 |
| 1989.6 | 0.024 |
| 1989.7 | 0.029 |
| 1989.8 | 0.031 |
| 1989.9 | 0.024 |
| 1990.0 | 0.023 |
| 1990.1 | 0.017 |
| 1990.2 | 0.016 |
| 1990.3 | 0.011 |
| 1990.4 | 0.009 |
| 1990.5 | 0.014 |
| 1990.6 | 0.017 |
| 1990.7 | 0.021 |
| 1990.8 | 0.026 |
| 1990.9 | 0.036 |
| 1991.0 | 0.034 |
| 1991.1 | 0.028 |
| 1991.2 | 0.02 |
| 1991.3 | 0.015 |
| 1991.4 | 0.013 |
| 1991.5 | 0.011 |
| 1991.6 | 0.012 |
| 1991.7 | 0.01 |
| 1991.8 | 0.005 |
| 1991.9 | 0.015 |
| 1992.0 | 0.002 |
| 1992.1 | 0.007 |
| 1992.2 | 0.012 |
| 1992.3 | 0.016 |
| 1992.4 | 0.014 |
| 1992.5 | 0.014 |
| 1992.6 | 0.012 |
| 1992.7 | 0.013 |
| 1992.8 | 0.018 |
| 1992.9 | 0.024 |
| 1993.0 | 0.022 |
| 1993.1 | 0.021 |
| 1993.2 | 0.022 |
| 1993.3 | 0.017 |
| 1993.4 | 0.011 |
| 1993.5 | 0.012 |
| 1993.6 | 0.012 |
| 1993.7 | 0.006 |
| 1993.8 | 0.014 |
| 1993.9 | 0.021 |
| 1994.0 | 0.02 |
| 1994.1 | 0.017 |
| 1994.2 | 0.026 |
| 1994.3 | 0.016 |
| 1994.4 | 0.019 |
| 1994.5 | 0.017 |
| 1994.6 | 0.022 |
| 1994.7 | 0.013 |
| 1994.8 | 0.009 |
| 1994.9 | 0.008 |
| 1995.0 | 0.01 |
| 1995.1 | 0.008 |
| 1995.2 | 0.017 |
| 1995.3 | 0.021 |
| 1995.4 | 0.017 |
| 1995.5 | 0.022 |
| 1995.6 | 0.027 |
| 1995.7 | 0.021 |
| 1995.8 | 0.026 |
| 1995.9 | 0.024 |
| 1996.0 | 0.02 |
| 1996.1 | 0.018 |
| 1996.2 | 0.016 |
| 1996.3 | 0.02 |
| 1996.4 | 0.02 |
| 1996.5 | 0.02 |
| 1996.6 | 0.027 |
| 1996.7 | 0.034 |
| 1996.8 | 0.03 |
| 1996.9 | 0.028 |
| 1997.0 | 0.026 |
| 1997.1 | 0.015 |
| 1997.2 | 0.011 |
| 1997.3 | 0.005 |
| 1997.4 | 0.013 |
| 1997.5 | 0.015 |
| 1997.6 | 0.021 |
| 1997.7 | 0.022 |
| 1997.8 | 0.021 |
| 1997.9 | 0.016 |
| 1998.0 | 0.014 |
| 1998.1 | 0.01 |
| 1998.2 | 0.011 |
| 1998.3 | 0.018 |
| 1998.4 | 0.014 |
| 1998.5 | 0.016 |
| 1998.6 | 0.018 |
| 1998.7 | 0.013 |
| 1998.8 | 0.016 |
| 1998.9 | 0.017 |
| 1999.0 | 0.016 |
| 1999.1 | 0.015 |
| 1999.2 | 0.018 |
| 1999.3 | 0.017 |
| 1999.4 | 0.016 |
| 1999.5 | 0.016 |
| 1999.6 | 0.024 |
| 1999.7 | 0.021 |
| 1999.8 | 0.021 |
| 1999.9 | 0.022 |
| 2000.0 | 0.021 |
| 2000.1 | 0.008 |
| 2000.2 | 0.009 |
| 2000.3 | 0.012 |
| 2000.4 | 0.022 |
| 2000.5 | 0.031 |
| 2000.6 | 0.038 |
| 2000.7 | 0.037 |
| 2000.8 | 0.034 |
| 2000.9 | 0.027 |
| 2001.0 | 0.019 |
| 2001.1 | 0.015 |
| 2001.2 | 0.019 |
| 2001.3 | 0.017 |
| 2001.4 | 0.022 |
| 2001.5 | 0.029 |
| 2001.6 | 0.032 |
| 2001.7 | 0.03 |
| 2001.8 | 0.033 |
| 2001.9 | 0.032 |
| 2002.0 | 0.029 |
| 2002.1 | 0.031 |
| 2002.2 | 0.028 |
| 2002.3 | 0.033 |
| 2002.4 | 0.021 |
| 2002.5 | 0.017 |
| 2002.6 | 0.02 |
| 2002.7 | 0.028 |
| 2002.8 | 0.016 |
| 2002.9 | 0.028 |
| 2003.0 | 0.03 |
| 2003.1 | 0.028 |
| 2003.2 | 0.025 |
| 2003.3 | 0.033 |
| 2003.4 | 0.033 |
| 2003.5 | 0.033 |
| 2003.6 | 0.037 |
| 2003.7 | 0.035 |
| 2003.8 | 0.035 |
| 2003.9 | 0.038 |
| 2004.0 | 0.04 |
| 2004.1 | 0.033 |
| 2004.2 | 0.035 |
| 2004.3 | 0.041 |
| 2004.4 | 0.04 |
| 2004.5 | 0.031 |
| 2004.6 | 0.035 |
| 2004.7 | 0.032 |
| 2004.8 | 0.024 |
| 2004.9 | 0.029 |
| 2005.0 | 0.042 |
| 2005.1 | 0.046 |
| 2005.2 | 0.048 |
| 2005.3 | 0.052 |
| 2005.4 | 0.045 |
| 2005.5 | 0.037 |
| 2005.6 | 0.032 |
| 2005.7 | 0.038 |
| 2005.8 | 0.038 |
| 2005.9 | 0.044 |
| 2006.0 | 0.044 |
| 2006.1 | 0.044 |
| 2006.2 | 0.04 |
| 2006.3 | 0.04 |
| 2006.4 | 0.041 |
| 2006.5 | 0.043 |
| 2006.6 | 0.042 |
| 2006.7 | 0.041 |
| 2006.8 | 0.043 |
| 2006.9 | 0.036 |
| 2007.0 | 0.038 |
| 2007.1 | 0.048 |
| 2007.2 | 0.052 |
| 2007.3 | 0.05 |
| 2007.4 | 0.05 |
| 2007.5 | 0.046 |
| 2007.6 | 0.035 |
| 2007.7 | 0.034 |
| 2007.8 | 0.039 |
| 2007.9 | 0.039 |
| 2008.0 | 0.043 |
| 2008.1 | 0.046 |
| 2008.2 | 0.047 |
| 2008.3 | 0.043 |
| 2008.4 | 0.046 |
| 2008.5 | 0.045 |
| 2008.6 | 0.05 |
| 2008.7 | 0.039 |
| 2008.8 | 0.036 |
| 2008.9 | 0.04 |
| 2009.0 | 0.049 |
| 2009.1 | 0.046 |
| 2009.2 | 0.056 |
| 2009.3 | 0.053 |
| 2009.4 | 0.048 |
| 2009.5 | 0.043 |
| 2009.6 | 0.043 |
| 2009.7 | 0.043 |
| 2009.8 | 0.05 |
| 2009.9 | 0.059 |
| 2010.0 | 0.058 |
| 2010.1 | 0.061 |
| 2010.2 | 0.06 |
| 2010.3 | 0.058 |
| 2010.4 | 0.048 |
| 2010.5 | 0.054 |
| 2010.6 | 0.056 |
| 2010.7 | 0.06 |
| 2010.8 | 0.064 |
| 2010.9 | 0.068 |
| 2011.0 | 0.068 |
| 2011.1 | 0.066 |
| 2011.2 | 0.068 |
| 2011.3 | 0.068 |
| 2011.4 | 0.066 |
| 2011.5 | 0.062 |
| 2011.6 | 0.059 |
| 2011.7 | 0.059 |
| 2011.8 | 0.061 |
| 2011.9 | 0.065 |
| 2012.0 | 0.063 |
| 2012.1 | 0.071 |
| 2012.2 | 0.074 |
| 2012.3 | 0.075 |
| 2012.4 | 0.077 |
| 2012.5 | 0.085 |
| 2012.6 | 0.083 |
| 2012.7 | 0.074 |
| 2012.8 | 0.071 |
| 2012.9 | 0.064 |
| 2013.0 | 0.061 |
| 2013.1 | 0.059 |
| 2013.2 | 0.065 |
| 2013.3 | 0.071 |
| 2013.4 | 0.08 |
| 2013.5 | 0.092 |
| 2013.6 | 0.091 |
| 2013.7 | 0.087 |
| 2013.8 | 0.095 |
| 2013.9 | 0.099 |
| 2014.0 | 0.096 |
| 2014.1 | 0.103 |
| 2014.2 | 0.119 |
| 2014.3 | 0.11 |
| 2014.4 | 0.108 |
| 2014.5 | 0.108 |
| 2014.6 | 0.108 |
| 2014.7 | 0.107 |
| 2014.8 | 0.113 |
| 2014.9 | 0.117 |
| 2015.0 | 0.126 |
| 2015.1 | 0.14 |
| 2015.2 | 0.14 |
| 2015.3 | 0.148 |
| 2015.4 | 0.154 |
| 2015.5 | 0.151 |
| 2015.6 | 0.15 |
| 2015.7 | 0.161 |
| 2015.8 | 0.163 |
| 2015.9 | 0.169 |
| 2016.0 | 0.178 |
| 2016.1 | 0.178 |
| 2016.2 | 0.171 |
| 2016.3 | 0.167 |
| 2016.4 | 0.167 |
| 2016.5 | 0.164 |
| 2016.6 | 0.166 |
| 2016.7 | 0.174 |
| 2016.8 | 0.181 |
| 2016.9 | 0.184 |
| 2017.0 | 0.182 |
| 2017.1 | 0.18 |
| 2017.2 | 0.179 |
| 2017.3 | 0.172 |
| 2017.4 | 0.168 |
| 2017.5 | 0.173 |
| 2017.6 | 0.171 |
| 2017.7 | 0.16 |
| 2017.8 | 0.161 |
| 2017.9 | 0.153 |
| 2018.0 | 0.146 |
| 2018.1 | 0.139 |
| 2018.2 | 0.141 |
| 2018.3 | 0.132 |
| 2018.4 | 0.139 |
| 2018.5 | 0.139 |
| 2018.6 | 0.141 |
| 2018.7 | 0.141 |
| 2018.8 | 0.135 |
| 2018.9 | 0.127 |
| 2019.0 | 0.121 |
| 2019.1 | 0.116 |
| 2019.2 | 0.108 |
| 2019.3 | 0.11 |
| 2019.4 | 0.111 |
| 2019.5 | 0.101 |
| 2019.6 | 0.099 |
| 2019.7 | 0.109 |
| 2019.8 | 0.114 |
| 2019.9 | 0.109 |
| 2020.0 | 0.117 |
| 2020.1 | 0.114 |
| 2020.2 | 0.104 |
| 2020.3 | 0.103 |
| 2020.4 | 0.094 |
| 2020.5 | 0.099 |
| 2020.6 | 0.098 |
| 2020.7 | 0.099 |
| 2020.8 | 0.09 |
| 2020.9 | 0.096 |
| 2021.0 | 0.089 |
| 2021.1 | 0.092 |
| 2021.2 | 0.091 |
| 2021.3 | 0.089 |
| 2021.4 | 0.091 |
| 2021.5 | 0.088 |
| 2021.6 | 0.083 |
| 2021.7 | 0.088 |
| 2021.8 | 0.096 |
| 2021.9 | 0.098 |
| 2022.0 | 0.095 |
| 2022.1 | 0.103 |
| 2022.2 | 0.086 |
| 2022.3 | 0.074 |
| 2022.4 | 0.064 |
| 2022.5 | 0.071 |
| 2022.6 | 0.069 |
| 2022.7 | 0.079 |
| 2022.8 | 0.081 |
| 2022.9 | 0.088 |
| 2023.0 | 0.085 |
| 2023.1 | 0.085 |
| 2023.2 | 0.087 |
| 2023.3 | 0.089 |
| 2023.4 | 0.086 |
| 2023.5 | 0.081 |
| 2023.6 | 0.076 |
| 2023.7 | 0.075 |
| 2023.8 | 0.078 |
| 2023.9 | 0.079 |
| 2024.0 | 0.079 |
| 2024.1 | 0.083 |
| 2024.2 | 0.086 |
| 2024.3 | 0.09 |
| 2024.4 | 0.093 |
| 2024.5 | 0.099 |
| 2024.6 | 0.096 |
| 2024.7 | 0.089 |
| 2024.8 | 0.08 |
| 2024.9 | 0.077 |
| 2025.0 | 0.077 |
| 2025.1 | 0.076 |
| 2025.2 | 0.075 |
| 2025.3 | 0.074 |
| 2025.4 | 0.074 |
| 2025.5 | 0.075 |
| 2025.6 | 0.079 |
| 2025.7 | 0.082 |
| 2025.8 | 0.086 |
| 2025.9 | 0.086 |
| 2026.0 | 0.081 |
| 2026.1 | 0.079 |
| 2026.2 | 0.075 |
| 2026.3 | 0.071 |
| 2026.4 | 0.069 |
| 2026.5 | 0.072 |
| 2026.6 | 0.063 |
| 2026.7 | 0.063 |
| 2026.8 | 0.07 |
| 2026.9 | 0.071 |
| 2027.0 | 0.072 |
| 2027.1 | 0.082 |
| 2027.2 | 0.088 |
| 2027.3 | 0.079 |
| 2027.4 | 0.08 |
| 2027.5 | 0.075 |
| 2027.6 | 0.075 |
| 2027.7 | 0.078 |
| 2027.8 | 0.084 |
| 2027.9 | 0.08 |
| 2028.0 | 0.084 |
| 2028.1 | 0.082 |
| 2028.2 | 0.077 |
| 2028.3 | 0.076 |
| 2028.4 | 0.075 |
| 2028.5 | 0.071 |
| 2028.6 | 0.067 |
| 2028.7 | 0.065 |
| 2028.8 | 0.058 |
| 2028.9 | 0.055 |
| 2029.0 | 0.055 |
| 2029.1 | 0.058 |
| 2029.2 | 0.055 |
| 2029.3 | 0.061 |
| 2029.4 | 0.065 |
| 2029.5 | 0.059 |
| 2029.6 | 0.06 |
| 2029.7 | 0.065 |
| 2029.8 | 0.061 |
| 2029.9 | 0.069 |
| 2030.0 | 0.077 |
| 2030.1 | 0.071 |
| 2030.2 | 0.074 |
| 2030.3 | 0.071 |
| 2030.4 | 0.059 |
| 2030.5 | 0.057 |
| 2030.6 | 0.058 |
| 2030.7 | 0.053 |
| 2030.8 | 0.056 |
| 2030.9 | 0.056 |
| 2031.0 | 0.054 |
| 2031.1 | 0.059 |
| 2031.2 | 0.059 |
| 2031.3 | 0.064 |
| 2031.4 | 0.069 |
| 2031.5 | 0.069 |
| 2031.6 | 0.063 |
| 2031.7 | 0.057 |
| 2031.8 | 0.056 |
| 2031.9 | 0.059 |
| 2032.0 | 0.063 |
| 2032.1 | 0.068 |
| 2032.2 | 0.071 |
| 2032.3 | 0.071 |
| 2032.4 | 0.071 |
| 2032.5 | 0.071 |
| 2032.6 | 0.068 |
| 2032.7 | 0.071 |
| 2032.8 | 0.072 |
| 2032.9 | 0.075 |
| 2033.0 | 0.073 |
| 2033.1 | 0.07 |
| 2033.2 | 0.082 |
| 2033.3 | 0.08 |
| 2033.4 | 0.076 |
| 2033.5 | 0.079 |
| 2033.6 | 0.091 |
| 2033.7 | 0.08 |
| 2033.8 | 0.086 |
| 2033.9 | 0.092 |
| 2034.0 | 0.093 |
| 2034.1 | 0.092 |
| 2034.2 | 0.093 |
| 2034.3 | 0.094 |
| 2034.4 | 0.093 |
| 2034.5 | 0.098 |
| 2034.6 | 0.093 |
| 2034.7 | 0.093 |
| 2034.8 | 0.09 |
| 2034.9 | 0.083 |
| 2035.0 | 0.081 |
| 2035.1 | 0.087 |
| 2035.2 | 0.093 |
| 2035.3 | 0.093 |
| 2035.4 | 0.103 |
| 2035.5 | 0.101 |
| 2035.6 | 0.111 |
| 2035.7 | 0.112 |
| 2035.8 | 0.114 |
| 2035.9 | 0.111 |
| 2036.0 | 0.103 |
| 2036.1 | 0.1 |
| 2036.2 | 0.096 |
| 2036.3 | 0.087 |
| 2036.4 | 0.091 |
| 2036.5 | 0.089 |
| 2036.6 | 0.085 |
| 2036.7 | 0.085 |
| 2036.8 | 0.093 |
| 2036.9 | 0.093 |
| 2037.0 | 0.103 |
| 2037.1 | 0.098 |
| 2037.2 | 0.094 |
| 2037.3 | 0.099 |
| 2037.4 | 0.09 |
| 2037.5 | 0.094 |
| 2037.6 | 0.101 |
| 2037.7 | 0.108 |
| 2037.8 | 0.098 |
| 2037.9 | 0.103 |
| 2038.0 | 0.102 |
| 2038.1 | 0.099 |
| 2038.2 | 0.102 |
| 2038.3 | 0.109 |
| 2038.4 | 0.105 |
| 2038.5 | 0.1 |
| 2038.6 | 0.096 |
| 2038.7 | 0.085 |
| 2038.8 | 0.084 |
| 2038.9 | 0.085 |
| 2039.0 | 0.091 |
| 2039.1 | 0.09 |
| 2039.2 | 0.095 |
| 2039.3 | 0.1 |
| 2039.4 | 0.111 |
| 2039.5 | 0.105 |
| 2039.6 | 0.112 |
| 2039.7 | 0.113 |
| 2039.8 | 0.106 |
| 2039.9 | 0.096 |
| 2040.0 | 0.097 |
| 2040.1 | 0.089 |
| 2040.2 | 0.092 |
| 2040.3 | 0.093 |
| 2040.4 | 0.098 |
| 2040.5 | 0.103 |
| 2040.6 | 0.104 |
| 2040.7 | 0.1 |
| 2040.8 | 0.102 |
| 2040.9 | 0.096 |
| 2041.0 | 0.101 |
| 2041.1 | 0.102 |
| 2041.2 | 0.106 |
| 2041.3 | 0.102 |
| 2041.4 | 0.106 |
| 2041.5 | 0.102 |
| 2041.6 | 0.101 |
| 2041.7 | 0.097 |
| 2041.8 | 0.093 |
| 2041.9 | 0.091 |
| 2042.0 | 0.089 |
| 2042.1 | 0.094 |
| 2042.2 | 0.098 |
| 2042.3 | 0.102 |
| 2042.4 | 0.101 |
| 2042.5 | 0.095 |
| 2042.6 | 0.087 |
| 2042.7 | 0.075 |
| 2042.8 | 0.078 |
| 2042.9 | 0.087 |
| 2043.0 | 0.097 |
| 2043.1 | 0.108 |
| 2043.2 | 0.117 |
| 2043.3 | 0.108 |
| 2043.4 | 0.104 |
| 2043.5 | 0.095 |
| 2043.6 | 0.094 |
| 2043.7 | 0.095 |
| 2043.8 | 0.096 |
| 2043.9 | 0.092 |
| 2044.0 | 0.098 |
| 2044.1 | 0.091 |
| 2044.2 | 0.091 |
| 2044.3 | 0.098 |
| 2044.4 | 0.104 |
| 2044.5 | 0.104 |
| 2044.6 | 0.107 |
| 2044.7 | 0.106 |
| 2044.8 | 0.102 |
| 2044.9 | 0.096 |
| 2045.0 | 0.098 |
| 2045.1 | 0.098 |
| 2045.2 | 0.092 |
| 2045.3 | 0.091 |
| 2045.4 | 0.094 |
| 2045.5 | 0.089 |
| 2045.6 | 0.093 |
| 2045.7 | 0.098 |
| 2045.8 | 0.102 |
| 2045.9 | 0.101 |
| 2046.0 | 0.101 |
| 2046.1 | 0.088 |
| 2046.2 | 0.086 |
| 2046.3 | 0.077 |
| 2046.4 | 0.073 |
| 2046.5 | 0.068 |
| 2046.6 | 0.075 |
| 2046.7 | 0.077 |
| 2046.8 | 0.077 |
| 2046.9 | 0.078 |
| 2047.0 | 0.082 |
| 2047.1 | 0.079 |
| 2047.2 | 0.081 |
| 2047.3 | 0.086 |
| 2047.4 | 0.081 |
| 2047.5 | 0.075 |
| 2047.6 | 0.07 |
| 2047.7 | 0.061 |
| 2047.8 | 0.06 |
| 2047.9 | 0.066 |
| 2048.0 | 0.065 |
| 2048.1 | 0.073 |
| 2048.2 | 0.082 |
| 2048.3 | 0.084 |
| 2048.4 | 0.087 |
| 2048.5 | 0.086 |
| 2048.6 | 0.08 |
| 2048.7 | 0.074 |
| 2048.8 | 0.066 |
| 2048.9 | 0.059 |
| 2049.0 | 0.065 |
| 2049.1 | 0.068 |
| 2049.2 | 0.076 |
| 2049.3 | 0.086 |
| 2049.4 | 0.09 |
| 2049.5 | 0.091 |
| 2049.6 | 0.087 |
| 2049.7 | 0.085 |
| 2049.8 | 0.078 |
| 2049.9 | 0.079 |
| 2050.0 | 0.076 |
| 2050.1 | 0.085 |
| 2050.2 | 0.084 |
| 2050.3 | 0.093 |
| 2050.4 | 0.1 |
| 2050.5 | 0.109 |
| 2050.6 | 0.101 |
| 2050.7 | 0.102 |
| 2050.8 | 0.096 |
| 2050.9 | 0.092 |
| 2051.0 | 0.087 |
| 2051.1 | 0.09 |
| 2051.2 | 0.082 |
| 2051.3 | 0.08 |
| 2051.4 | 0.074 |
| 2051.5 | 0.066 |
| 2051.6 | 0.066 |
| 2051.7 | 0.07 |
| 2051.8 | 0.076 |
| 2051.9 | 0.071 |
| 2052.0 | 0.078 |
| 2052.1 | 0.079 |
| 2052.2 | 0.078 |
| 2052.3 | 0.075 |
| 2052.4 | 0.083 |
| 2052.5 | 0.071 |
| 2052.6 | 0.068 |
| 2052.7 | 0.065 |
| 2052.8 | 0.063 |
| 2052.9 | 0.056 |
| 2053.0 | 0.07 |
| 2053.1 | 0.075 |
| 2053.2 | 0.077 |
| 2053.3 | 0.078 |
| 2053.4 | 0.078 |
| 2053.5 | 0.075 |
| 2053.6 | 0.064 |
| 2053.7 | 0.059 |
| 2053.8 | 0.061 |
| 2053.9 | 0.063 |
| 2054.0 | 0.065 |
| 2054.1 | 0.07 |
| 2054.2 | 0.065 |
| 2054.3 | 0.062 |
| 2054.4 | 0.059 |
| 2054.5 | 0.058 |
| 2054.6 | 0.066 |
| 2054.7 | 0.073 |
| 2054.8 | 0.073 |
| 2054.9 | 0.062 |
| 2055.0 | 0.058 |
| 2055.1 | 0.054 |
| 2055.2 | 0.058 |
| 2055.3 | 0.059 |
| 2055.4 | 0.069 |
| 2055.5 | 0.071 |
| 2055.6 | 0.061 |
| 2055.7 | 0.059 |
| 2055.8 | 0.061 |
| 2055.9 | 0.063 |
| 2056.0 | 0.062 |
| 2056.1 | 0.064 |
| 2056.2 | 0.064 |
| 2056.3 | 0.056 |
| 2056.4 | 0.057 |
| 2056.5 | 0.057 |
| 2056.6 | 0.065 |
| 2056.7 | 0.07 |
| 2056.8 | 0.075 |
| 2056.9 | 0.079 |
| 2057.0 | 0.088 |
| 2057.1 | 0.085 |
| 2057.2 | 0.081 |
| 2057.3 | 0.091 |
| 2057.4 | 0.083 |
| 2057.5 | 0.067 |
| 2057.6 | 0.073 |
| 2057.7 | 0.065 |
| 2057.8 | 0.049 |
| 2057.9 | 0.06 |
| 2058.0 | 0.065 |
| 2058.1 | 0.061 |
| 2058.2 | 0.07 |
| 2058.3 | 0.078 |
| 2058.4 | 0.082 |
| 2058.5 | 0.081 |
| 2058.6 | 0.085 |
| 2058.7 | 0.093 |
| 2058.8 | 0.094 |
| 2058.9 | 0.078 |
| 2059.0 | 0.082 |
| 2059.1 | 0.076 |
| 2059.2 | 0.071 |
| 2059.3 | 0.07 |
| 2059.4 | 0.077 |
| 2059.5 | 0.076 |
| 2059.6 | 0.079 |
| 2059.7 | 0.071 |
| 2059.8 | 0.068 |
| 2059.9 | 0.071 |
| 2060.0 | 0.071 |
| 2060.1 | 0.067 |
| 2060.2 | 0.073 |
| 2060.3 | 0.083 |
| 2060.4 | 0.085 |
| 2060.5 | 0.092 |
| 2060.6 | 0.102 |
| 2060.7 | 0.11 |
| 2060.8 | 0.102 |
| 2060.9 | 0.1 |
| 2061.0 | 0.095 |
| 2061.1 | 0.087 |
| 2061.2 | 0.078 |
| 2061.3 | 0.08 |
| 2061.4 | 0.079 |
| 2061.5 | 0.071 |
| 2061.6 | 0.076 |
| 2061.7 | 0.087 |
| 2061.8 | 0.085 |
| 2061.9 | 0.089 |
| 2062.0 | 0.102 |
| 2062.1 | 0.101 |
| 2062.2 | 0.092 |
| 2062.3 | 0.094 |
| 2062.4 | 0.091 |
| 2062.5 | 0.079 |
| 2062.6 | 0.08 |
| 2062.7 | 0.079 |
| 2062.8 | 0.081 |
| 2062.9 | 0.08 |
| 2063.0 | 0.09 |
| 2063.1 | 0.087 |
| 2063.2 | 0.089 |
| 2063.3 | 0.099 |
| 2063.4 | 0.1 |
| 2063.5 | 0.106 |
| 2063.6 | 0.108 |
| 2063.7 | 0.105 |
| 2063.8 | 0.095 |
| 2063.9 | 0.097 |
| 2064.0 | 0.093 |
| 2064.1 | 0.099 |
| 2064.2 | 0.105 |
| 2064.3 | 0.109 |
| 2064.4 | 0.105 |
| 2064.5 | 0.107 |
| 2064.6 | 0.106 |
| 2064.7 | 0.106 |
| 2064.8 | 0.099 |
| 2064.9 | 0.104 |
| 2065.0 | 0.1 |
| 2065.1 | 0.092 |
| 2065.2 | 0.095 |
| 2065.3 | 0.097 |
| 2065.4 | 0.091 |
| 2065.5 | 0.097 |
| 2065.6 | 0.105 |
| 2065.7 | 0.102 |
| 2065.8 | 0.111 |
| 2065.9 | 0.115 |
| 2066.0 | 0.119 |
| 2066.1 | 0.121 |
| 2066.2 | 0.118 |
| 2066.3 | 0.117 |
| 2066.4 | 0.122 |
| 2066.5 | 0.111 |
| 2066.6 | 0.112 |
| 2066.7 | 0.118 |
| 2066.8 | 0.117 |
| 2066.9 | 0.114 |
| 2067.0 | 0.114 |
| 2067.1 | 0.11 |
| 2067.2 | 0.111 |
| 2067.3 | 0.117 |
| 2067.4 | 0.121 |
| 2067.5 | 0.13 |
| 2067.6 | 0.131 |
| 2067.7 | 0.123 |
| 2067.8 | 0.113 |
| 2067.9 | 0.103 |
| 2068.0 | 0.1 |
| 2068.1 | 0.109 |
| 2068.2 | 0.107 |
| 2068.3 | 0.116 |
| 2068.4 | 0.121 |
| 2068.5 | 0.137 |
| 2068.6 | 0.13 |
| 2068.7 | 0.14 |
| 2068.8 | 0.145 |
| 2068.9 | 0.141 |
| 2069.0 | 0.125 |
| 2069.1 | 0.118 |
| 2069.2 | 0.11 |
| 2069.3 | 0.093 |
| 2069.4 | 0.099 |
| 2069.5 | 0.104 |
| 2069.6 | 0.116 |
| 2069.7 | 0.123 |
| 2069.8 | 0.137 |
| 2069.9 | 0.127 |
| 2070.0 | 0.125 |
| 2070.1 | 0.119 |
| 2070.2 | 0.115 |
| 2070.3 | 0.116 |
| 2070.4 | 0.117 |
| 2070.5 | 0.105 |
| 2070.6 | 0.1 |
| 2070.7 | 0.095 |
| 2070.8 | 0.086 |
| 2070.9 | 0.092 |
| 2071.0 | 0.101 |
| 2071.1 | 0.098 |
| 2071.2 | 0.101 |
| 2071.3 | 0.104 |
| 2071.4 | 0.104 |
| 2071.5 | 0.094 |
| 2071.6 | 0.1 |
| 2071.7 | 0.105 |
| 2071.8 | 0.096 |
| 2071.9 | 0.095 |
| 2072.0 | 0.092 |
| 2072.1 | 0.093 |
| 2072.2 | 0.08 |
| 2072.3 | 0.082 |
| 2072.4 | 0.078 |
| 2072.5 | 0.093 |
| 2072.6 | 0.094 |
| 2072.7 | 0.103 |
| 2072.8 | 0.114 |
| 2072.9 | 0.121 |
| 2073.0 | 0.112 |
| 2073.1 | 0.107 |
| 2073.2 | 0.114 |
| 2073.3 | 0.108 |
| 2073.4 | 0.096 |
| 2073.5 | 0.109 |
| 2073.6 | 0.112 |
| 2073.7 | 0.102 |
| 2073.8 | 0.11 |
| 2073.9 | 0.112 |
| 2074.0 | 0.104 |
| 2074.1 | 0.11 |
| 2074.2 | 0.114 |
| 2074.3 | 0.11 |
| 2074.4 | 0.121 |
| 2074.5 | 0.131 |
| 2074.6 | 0.125 |
| 2074.7 | 0.128 |
| 2074.8 | 0.124 |
| 2074.9 | 0.118 |
| 2075.0 | 0.108 |
| 2075.1 | 0.118 |
| 2075.2 | 0.115 |
| 2075.3 | 0.126 |
| 2075.4 | 0.118 |
| 2075.5 | 0.131 |
| 2075.6 | 0.133 |
| 2075.7 | 0.136 |
| 2075.8 | 0.13 |
| 2075.9 | 0.136 |
| 2076.0 | 0.133 |
| 2076.1 | 0.138 |
| 2076.2 | 0.145 |
| 2076.3 | 0.155 |
| 2076.4 | 0.167 |
| 2076.5 | 0.169 |
| 2076.6 | 0.164 |
| 2076.7 | 0.17 |
| 2076.8 | 0.182 |
| 2076.9 | 0.19 |
| 2077.0 | 0.188 |
| 2077.1 | 0.191 |
| 2077.2 | 0.19 |
| 2077.3 | 0.176 |
| 2077.4 | 0.173 |
| 2077.5 | 0.173 |
| 2077.6 | 0.172 |
| 2077.7 | 0.171 |
| 2077.8 | 0.18 |
| 2077.9 | 0.176 |
| 2078.0 | 0.18 |
| 2078.1 | 0.174 |
| 2078.2 | 0.168 |
| 2078.3 | 0.161 |
| 2078.4 | 0.16 |
| 2078.5 | 0.157 |
| 2078.6 | 0.157 |
| 2078.7 | 0.154 |
| 2078.8 | 0.157 |
| 2078.9 | 0.158 |
| 2079.0 | 0.164 |
| 2079.1 | 0.171 |
| 2079.2 | 0.174 |
| 2079.3 | 0.167 |
| 2079.4 | 0.171 |
| 2079.5 | 0.169 |
| 2079.6 | 0.171 |
| 2079.7 | 0.181 |
| 2079.8 | 0.192 |
| 2079.9 | 0.192 |
| 2080.0 | 0.195 |
| 2080.1 | 0.192 |
| 2080.2 | 0.188 |
| 2080.3 | 0.186 |
| 2080.4 | 0.193 |
| 2080.5 | 0.185 |
| 2080.6 | 0.185 |
| 2080.7 | 0.185 |
| 2080.8 | 0.171 |
| 2080.9 | 0.165 |
| 2081.0 | 0.171 |
| 2081.1 | 0.169 |
| 2081.2 | 0.154 |
| 2081.3 | 0.161 |
| 2081.4 | 0.155 |
| 2081.5 | 0.141 |
| 2081.6 | 0.138 |
| 2081.7 | 0.149 |
| 2081.8 | 0.147 |
| 2081.9 | 0.146 |
| 2082.0 | 0.148 |
| 2082.1 | 0.15 |
| 2082.2 | 0.141 |
| 2082.3 | 0.145 |
| 2082.4 | 0.132 |
| 2082.5 | 0.129 |
| 2082.6 | 0.132 |
| 2082.7 | 0.137 |
| 2082.8 | 0.122 |
| 2082.9 | 0.131 |
| 2083.0 | 0.131 |
| 2083.1 | 0.123 |
| 2083.2 | 0.123 |
| 2083.3 | 0.133 |
| 2083.4 | 0.139 |
| 2083.5 | 0.141 |
| 2083.6 | 0.142 |
| 2083.7 | 0.13 |
| 2083.8 | 0.131 |
| 2083.9 | 0.135 |
| 2084.0 | 0.138 |
| 2084.1 | 0.141 |
| 2084.2 | 0.151 |
| 2084.3 | 0.151 |
| 2084.4 | 0.147 |
| 2084.5 | 0.147 |
| 2084.6 | 0.14 |
| 2084.7 | 0.141 |
| 2084.8 | 0.141 |
| 2084.9 | 0.143 |
| 2085.0 | 0.143 |
| 2085.1 | 0.159 |
| 2085.2 | 0.165 |
| 2085.3 | 0.158 |
| 2085.4 | 0.16 |
| 2085.5 | 0.168 |
| 2085.6 | 0.166 |
| 2085.7 | 0.159 |
| 2085.8 | 0.175 |
| 2085.9 | 0.178 |
| 2086.0 | 0.171 |
| 2086.1 | 0.175 |
| 2086.2 | 0.186 |
| 2086.3 | 0.176 |
| 2086.4 | 0.17 |
| 2086.5 | 0.17 |
| 2086.6 | 0.162 |
| 2086.7 | 0.151 |
| 2086.8 | 0.166 |
| 2086.9 | 0.164 |
| 2087.0 | 0.166 |
| 2087.1 | 0.168 |
| 2087.2 | 0.172 |
| 2087.3 | 0.169 |
| 2087.4 | 0.182 |
| 2087.5 | 0.189 |
| 2087.6 | 0.21 |
| 2087.7 | 0.212 |
| 2087.8 | 0.207 |
| 2087.9 | 0.2 |
| 2088.0 | 0.205 |
| 2088.1 | 0.198 |
| 2088.2 | 0.204 |
| 2088.3 | 0.214 |
| 2088.4 | 0.215 |
| 2088.5 | 0.219 |
| 2088.6 | 0.22 |
| 2088.7 | 0.22 |
| 2088.8 | 0.229 |
| 2088.9 | 0.236 |
| 2089.0 | 0.237 |
| 2089.1 | 0.238 |
| 2089.2 | 0.246 |
| 2089.3 | 0.245 |
| 2089.4 | 0.246 |
| 2089.5 | 0.247 |
| 2089.6 | 0.244 |
| 2089.7 | 0.256 |
| 2089.8 | 0.258 |
| 2089.9 | 0.268 |
| 2090.0 | 0.273 |
| 2090.1 | 0.278 |
| 2090.2 | 0.267 |
| 2090.3 | 0.259 |
| 2090.4 | 0.26 |
| 2090.5 | 0.255 |
| 2090.6 | 0.262 |
| 2090.7 | 0.271 |
| 2090.8 | 0.278 |
| 2090.9 | 0.264 |
| 2091.0 | 0.263 |
| 2091.1 | 0.278 |
| 2091.2 | 0.267 |
| 2091.3 | 0.27 |
| 2091.4 | 0.27 |
| 2091.5 | 0.268 |
| 2091.6 | 0.238 |
| 2091.7 | 0.242 |
| 2091.8 | 0.23 |
| 2091.9 | 0.244 |
| 2092.0 | 0.245 |
| 2092.1 | 0.25 |
| 2092.2 | 0.251 |
| 2092.3 | 0.241 |
| 2092.4 | 0.228 |
| 2092.5 | 0.214 |
| 2092.6 | 0.206 |
| 2092.7 | 0.201 |
| 2092.8 | 0.203 |
| 2092.9 | 0.203 |
| 2093.0 | 0.209 |
| 2093.1 | 0.206 |
| 2093.2 | 0.191 |
| 2093.3 | 0.198 |
| 2093.4 | 0.198 |
| 2093.5 | 0.19 |
| 2093.6 | 0.196 |
| 2093.7 | 0.197 |
| 2093.8 | 0.192 |
| 2093.9 | 0.178 |
| 2094.0 | 0.182 |
| 2094.1 | 0.182 |
| 2094.2 | 0.189 |
| 2094.3 | 0.187 |
| 2094.4 | 0.198 |
| 2094.5 | 0.2 |
| 2094.6 | 0.199 |
| 2094.7 | 0.199 |
| 2094.8 | 0.205 |
| 2094.9 | 0.208 |
| 2095.0 | 0.209 |
| 2095.1 | 0.206 |
| 2095.2 | 0.207 |
| 2095.3 | 0.2 |
| 2095.4 | 0.202 |
| 2095.5 | 0.201 |
| 2095.6 | 0.215 |
| 2095.7 | 0.206 |
| 2095.8 | 0.216 |
| 2095.9 | 0.212 |
| 2096.0 | 0.211 |
| 2096.1 | 0.206 |
| 2096.2 | 0.213 |
| 2096.3 | 0.211 |
| 2096.4 | 0.206 |
| 2096.5 | 0.21 |
| 2096.6 | 0.21 |
| 2096.7 | 0.219 |
| 2096.8 | 0.219 |
| 2096.9 | 0.226 |
| 2097.0 | 0.223 |
| 2097.1 | 0.231 |
| 2097.2 | 0.222 |
| 2097.3 | 0.217 |
| 2097.4 | 0.212 |
| 2097.5 | 0.207 |
| 2097.6 | 0.205 |
| 2097.7 | 0.205 |
| 2097.8 | 0.21 |
| 2097.9 | 0.217 |
| 2098.0 | 0.221 |
| 2098.1 | 0.213 |
| 2098.2 | 0.204 |
| 2098.3 | 0.202 |
| 2098.4 | 0.19 |
| 2098.5 | 0.19 |
| 2098.6 | 0.187 |
| 2098.7 | 0.195 |
| 2098.8 | 0.192 |
| 2098.9 | 0.179 |
| 2099.0 | 0.176 |
| 2099.1 | 0.163 |
| 2099.2 | 0.152 |
| 2099.3 | 0.143 |
| 2099.4 | 0.143 |
| 2099.5 | 0.145 |
| 2099.6 | 0.151 |
| 2099.7 | 0.152 |
| 2099.8 | 0.148 |
| 2099.9 | 0.15 |
| 2100.0 | 0.133 |
| 2100.1 | 0.134 |
| 2100.2 | 0.138 |
| 2100.3 | 0.135 |
| 2100.4 | 0.127 |
| 2100.5 | 0.135 |
| 2100.6 | 0.124 |
| 2100.7 | 0.108 |
| 2100.8 | 0.111 |
| 2100.9 | 0.112 |
| 2101.0 | 0.103 |
| 2101.1 | 0.1 |
| 2101.2 | 0.104 |
| 2101.3 | 0.093 |
| 2101.4 | 0.095 |
| 2101.5 | 0.095 |
| 2101.6 | 0.095 |
| 2101.7 | 0.094 |
| 2101.8 | 0.104 |
| 2101.9 | 0.104 |
| 2102.0 | 0.104 |
| 2102.1 | 0.102 |
| 2102.2 | 0.102 |
| 2102.3 | 0.1 |
| 2102.4 | 0.101 |
| 2102.5 | 0.096 |
| 2102.6 | 0.093 |
| 2102.7 | 0.095 |
| 2102.8 | 0.096 |
| 2102.9 | 0.092 |
| 2103.0 | 0.094 |
| 2103.1 | 0.092 |
| 2103.2 | 0.079 |
| 2103.3 | 0.08 |
| 2103.4 | 0.071 |
| 2103.5 | 0.081 |
| 2103.6 | 0.091 |
| 2103.7 | 0.108 |
| 2103.8 | 0.098 |
| 2103.9 | 0.112 |
| 2104.0 | 0.101 |
| 2104.1 | 0.098 |
| 2104.2 | 0.099 |
| 2104.3 | 0.104 |
| 2104.4 | 0.099 |
| 2104.5 | 0.097 |
| 2104.6 | 0.093 |
| 2104.7 | 0.083 |
| 2104.8 | 0.091 |
| 2104.9 | 0.092 |
| 2105.0 | 0.086 |
| 2105.1 | 0.1 |
| 2105.2 | 0.098 |
| 2105.3 | 0.081 |
| 2105.4 | 0.086 |
| 2105.5 | 0.095 |
| 2105.6 | 0.089 |
| 2105.7 | 0.095 |
| 2105.8 | 0.106 |
| 2105.9 | 0.099 |
| 2106.0 | 0.101 |
| 2106.1 | 0.096 |
| 2106.2 | 0.111 |
| 2106.3 | 0.114 |
| 2106.4 | 0.118 |
| 2106.5 | 0.117 |
| 2106.6 | 0.128 |
| 2106.7 | 0.113 |
| 2106.8 | 0.112 |
| 2106.9 | 0.1 |
| 2107.0 | 0.095 |
| 2107.1 | 0.088 |
| 2107.2 | 0.082 |
| 2107.3 | 0.081 |
| 2107.4 | 0.085 |
| 2107.5 | 0.085 |
| 2107.6 | 0.079 |
| 2107.7 | 0.085 |
| 2107.8 | 0.076 |
| 2107.9 | 0.075 |
| 2108.0 | 0.078 |
| 2108.1 | 0.086 |
| 2108.2 | 0.077 |
| 2108.3 | 0.076 |
| 2108.4 | 0.079 |
| 2108.5 | 0.075 |
| 2108.6 | 0.063 |
| 2108.7 | 0.061 |
| 2108.8 | 0.062 |
| 2108.9 | 0.055 |
| 2109.0 | 0.049 |
| 2109.1 | 0.042 |
| 2109.2 | 0.042 |
| 2109.3 | 0.04 |
| 2109.4 | 0.044 |
| 2109.5 | 0.044 |
| 2109.6 | 0.053 |
| 2109.7 | 0.049 |
| 2109.8 | 0.045 |
| 2109.9 | 0.042 |
| 2110.0 | 0.044 |
| 2110.1 | 0.049 |
| 2110.2 | 0.053 |
| 2110.3 | 0.057 |
| 2110.4 | 0.05 |
| 2110.5 | 0.053 |
| 2110.6 | 0.04 |
| 2110.7 | 0.049 |
| 2110.8 | 0.045 |
| 2110.9 | 0.045 |
| 2111.0 | 0.048 |
| 2111.1 | 0.067 |
| 2111.2 | 0.056 |
| 2111.3 | 0.05 |
| 2111.4 | 0.06 |
| 2111.5 | 0.046 |
| 2111.6 | 0.039 |
| 2111.7 | 0.039 |
| 2111.8 | 0.049 |
| 2111.9 | 0.044 |
| 2112.0 | 0.058 |
| 2112.1 | 0.06 |
| 2112.2 | 0.069 |
| 2112.3 | 0.068 |
| 2112.4 | 0.072 |
| 2112.5 | 0.078 |
| 2112.6 | 0.07 |
| 2112.7 | 0.067 |
| 2112.8 | 0.071 |
| 2112.9 | 0.071 |
| 2113.0 | 0.06 |
| 2113.1 | 0.054 |
| 2113.2 | 0.052 |
| 2113.3 | 0.049 |
| 2113.4 | 0.045 |
| 2113.5 | 0.036 |
| 2113.6 | 0.046 |
| 2113.7 | 0.037 |
| 2113.8 | 0.038 |
| 2113.9 | 0.037 |
| 2114.0 | 0.046 |
| 2114.1 | 0.048 |
| 2114.2 | 0.046 |
| 2114.3 | 0.046 |
| 2114.4 | 0.036 |
| 2114.5 | 0.03 |
| 2114.6 | 0.037 |
| 2114.7 | 0.039 |
| 2114.8 | 0.033 |
| 2114.9 | 0.045 |
| 2115.0 | 0.051 |
| 2115.1 | 0.03 |
| 2115.2 | 0.033 |
| 2115.3 | 0.04 |
| 2115.4 | 0.043 |
| 2115.5 | 0.045 |
| 2115.6 | 0.055 |
| 2115.7 | 0.06 |
| 2115.8 | 0.053 |
| 2115.9 | 0.046 |
| 2116.0 | 0.044 |
| 2116.1 | 0.039 |
| 2116.2 | 0.034 |
| 2116.3 | 0.039 |
| 2116.4 | 0.04 |
| 2116.5 | 0.038 |
| 2116.6 | 0.03 |
| 2116.7 | 0.036 |
| 2116.8 | 0.028 |
| 2116.9 | 0.028 |
| 2117.0 | 0.031 |
| 2117.1 | 0.038 |
| 2117.2 | 0.034 |
| 2117.3 | 0.045 |
| 2117.4 | 0.041 |
| 2117.5 | 0.034 |
| 2117.6 | 0.032 |
| 2117.7 | 0.035 |
| 2117.8 | 0.039 |
| 2117.9 | 0.04 |
| 2118.0 | 0.045 |
| 2118.1 | 0.051 |
| 2118.2 | 0.046 |
| 2118.3 | 0.032 |
| 2118.4 | 0.026 |
| 2118.5 | 0.03 |
| 2118.6 | 0.028 |
| 2118.7 | 0.034 |
| 2118.8 | 0.046 |
| 2118.9 | 0.065 |
| 2119.0 | 0.062 |
| 2119.1 | 0.065 |
| 2119.2 | 0.061 |
| 2119.3 | 0.06 |
| 2119.4 | 0.049 |
| 2119.5 | 0.05 |
| 2119.6 | 0.064 |
| 2119.7 | 0.077 |
| 2119.8 | 0.082 |
| 2119.9 | 0.082 |
| 2120.0 | 0.088 |
| 2120.1 | 0.073 |
| 2120.2 | 0.068 |
| 2120.3 | 0.07 |
| 2120.4 | 0.082 |
| 2120.5 | 0.083 |
| 2120.6 | 0.095 |
| 2120.7 | 0.094 |
| 2120.8 | 0.1 |
| 2120.9 | 0.093 |
| 2121.0 | 0.102 |
| 2121.1 | 0.095 |
| 2121.2 | 0.099 |
| 2121.3 | 0.1 |
| 2121.4 | 0.098 |
| 2121.5 | 0.082 |
| 2121.6 | 0.085 |
| 2121.7 | 0.086 |
| 2121.8 | 0.08 |
| 2121.9 | 0.085 |
| 2122.0 | 0.093 |
| 2122.1 | 0.085 |
| 2122.2 | 0.085 |
| 2122.3 | 0.079 |
| 2122.4 | 0.088 |
| 2122.5 | 0.091 |
| 2122.6 | 0.102 |
| 2122.7 | 0.101 |
| 2122.8 | 0.108 |
| 2122.9 | 0.112 |
| 2123.0 | 0.114 |
| 2123.1 | 0.109 |
| 2123.2 | 0.11 |
| 2123.3 | 0.106 |
| 2123.4 | 0.095 |
| 2123.5 | 0.097 |
| 2123.6 | 0.093 |
| 2123.7 | 0.094 |
| 2123.8 | 0.096 |
| 2123.9 | 0.091 |
| 2124.0 | 0.083 |
| 2124.1 | 0.081 |
| 2124.2 | 0.063 |
| 2124.3 | 0.062 |
| 2124.4 | 0.056 |
| 2124.5 | 0.068 |
| 2124.6 | 0.069 |
| 2124.7 | 0.08 |
| 2124.8 | 0.072 |
| 2124.9 | 0.084 |
| 2125.0 | 0.069 |
| 2125.1 | 0.077 |
| 2125.2 | 0.076 |
| 2125.3 | 0.077 |
| 2125.4 | 0.064 |
| 2125.5 | 0.069 |
| 2125.6 | 0.064 |
| 2125.7 | 0.058 |
| 2125.8 | 0.067 |
| 2125.9 | 0.075 |
| 2126.0 | 0.064 |
| 2126.1 | 0.07 |
| 2126.2 | 0.074 |
| 2126.3 | 0.076 |
| 2126.4 | 0.072 |
| 2126.5 | 0.083 |
| 2126.6 | 0.074 |
| 2126.7 | 0.071 |
| 2126.8 | 0.063 |
| 2126.9 | 0.067 |
| 2127.0 | 0.056 |
| 2127.1 | 0.052 |
| 2127.2 | 0.048 |
| 2127.3 | 0.043 |
| 2127.4 | 0.046 |
| 2127.5 | 0.049 |
| 2127.6 | 0.056 |
| 2127.7 | 0.062 |
| 2127.8 | 0.067 |
| 2127.9 | 0.064 |
| 2128.0 | 0.066 |
| 2128.1 | 0.062 |
| 2128.2 | 0.059 |
| 2128.3 | 0.047 |
| 2128.4 | 0.048 |
| 2128.5 | 0.048 |
| 2128.6 | 0.046 |
| 2128.7 | 0.047 |
| 2128.8 | 0.058 |
| 2128.9 | 0.066 |
| 2129.0 | 0.074 |
| 2129.1 | 0.07 |
| 2129.2 | 0.07 |
| 2129.3 | 0.075 |
| 2129.4 | 0.07 |
| 2129.5 | 0.064 |
| 2129.6 | 0.074 |
| 2129.7 | 0.08 |
| 2129.8 | 0.079 |
| 2129.9 | 0.082 |
| 2130.0 | 0.076 |
| 2130.1 | 0.069 |
| 2130.2 | 0.065 |
| 2130.3 | 0.066 |
| 2130.4 | 0.07 |
| 2130.5 | 0.073 |
| 2130.6 | 0.074 |
| 2130.7 | 0.072 |
| 2130.8 | 0.074 |
| 2130.9 | 0.067 |
| 2131.0 | 0.069 |
| 2131.1 | 0.07 |
| 2131.2 | 0.072 |
| 2131.3 | 0.06 |
| 2131.4 | 0.049 |
| 2131.5 | 0.044 |
| 2131.6 | 0.041 |
| 2131.7 | 0.04 |
| 2131.8 | 0.038 |
| 2131.9 | 0.041 |
| 2132.0 | 0.044 |
| 2132.1 | 0.025 |
| 2132.2 | 0.02 |
| 2132.3 | 0.024 |
| 2132.4 | 0.027 |
| 2132.5 | 0.031 |
| 2132.6 | 0.044 |
| 2132.7 | 0.046 |
| 2132.8 | 0.052 |
| 2132.9 | 0.041 |
| 2133.0 | 0.034 |
| 2133.1 | 0.033 |
| 2133.2 | 0.036 |
| 2133.3 | 0.023 |
| 2133.4 | 0.032 |
| 2133.5 | 0.033 |
| 2133.6 | 0.039 |
| 2133.7 | 0.037 |
| 2133.8 | 0.04 |
| 2133.9 | 0.043 |
| 2134.0 | 0.036 |
| 2134.1 | 0.032 |
| 2134.2 | 0.027 |
| 2134.3 | 0.03 |
| 2134.4 | 0.025 |
| 2134.5 | 0.029 |
| 2134.6 | 0.033 |
| 2134.7 | 0.032 |
| 2134.8 | 0.034 |
| 2134.9 | 0.035 |
| 2135.0 | 0.034 |
| 2135.1 | 0.029 |
| 2135.2 | 0.025 |
| 2135.3 | 0.027 |
| 2135.4 | 0.033 |
| 2135.5 | 0.034 |
| 2135.6 | 0.037 |
| 2135.7 | 0.039 |
| 2135.8 | 0.035 |
| 2135.9 | 0.022 |
| 2136.0 | 0.019 |
| 2136.1 | 0.021 |
| 2136.2 | 0.016 |
| 2136.3 | 0.016 |
| 2136.4 | 0.019 |
| 2136.5 | 0.021 |
| 2136.6 | 0.025 |
| 2136.7 | 0.028 |
| 2136.8 | 0.032 |
| 2136.9 | 0.036 |
| 2137.0 | 0.027 |
| 2137.1 | 0.02 |
| 2137.2 | 0.025 |
| 2137.3 | 0.013 |
| 2137.4 | 0.02 |
| 2137.5 | 0.029 |
| 2137.6 | 0.038 |
| 2137.7 | 0.037 |
| 2137.8 | 0.047 |
| 2137.9 | 0.04 |
| 2138.0 | 0.043 |
| 2138.1 | 0.039 |
| 2138.2 | 0.032 |
| 2138.3 | 0.029 |
| 2138.4 | 0.024 |
| 2138.5 | 0.017 |
| 2138.6 | 0.016 |
| 2138.7 | 0.013 |
| 2138.8 | 0.006 |
| 2138.9 | 0.006 |
| 2139.0 | 0.004 |
| 2139.1 | 0 |
| 2139.2 | 0.012 |
| 2139.3 | 0.027 |
| 2139.4 | 0.033 |
| 2139.5 | 0.041 |
| 2139.6 | 0.043 |
| 2139.7 | 0.044 |
| 2139.8 | 0.032 |
| 2139.9 | 0.034 |
| 2140.0 | 0.033 |
| 2140.1 | 0.033 |
| 2140.2 | 0.029 |
| 2140.3 | 0.04 |
| 2140.4 | 0.04 |
| 2140.5 | 0.03 |
| 2140.6 | 0.031 |
| 2140.7 | 0.026 |
| 2140.8 | 0.016 |
| 2140.9 | 0.014 |
| 2141.0 | 0.019 |
| 2141.1 | 0.022 |
| 2141.2 | 0.021 |
| 2141.3 | 0.028 |
| 2141.4 | 0.029 |
| 2141.5 | 0.028 |
| 2141.6 | 0.021 |
| 2141.7 | 0.026 |
| 2141.8 | 0.029 |
| 2141.9 | 0.029 |
| 2142.0 | 0.025 |
| 2142.1 | 0.025 |
| 2142.2 | 0.022 |
| 2142.3 | 0.015 |
| 2142.4 | 0.023 |
| 2142.5 | 0.029 |
| 2142.6 | 0.026 |
| 2142.7 | 0.024 |
| 2142.8 | 0.036 |
| 2142.9 | 0.021 |
| 2143.0 | 0.019 |
| 2143.1 | 0.026 |
| 2143.2 | 0.033 |
| 2143.3 | 0.026 |
| 2143.4 | 0.028 |
| 2143.5 | 0.032 |
| 2143.6 | 0.029 |
| 2143.7 | 0.021 |
| 2143.8 | 0.01 |
| 2143.9 | 0.01 |
| 2144.0 | 0.002 |
| 2144.1 | 0.01 |
| 2144.2 | 0.002 |
| 2144.3 | 0.013 |
| 2144.4 | 0.01 |
| 2144.5 | 0.01 |
| 2144.6 | 0.021 |
| 2144.7 | 0.016 |
| 2144.8 | 0.016 |
| 2144.9 | 0.023 |
| 2145.0 | 0.033 |
| 2145.1 | 0.024 |
| 2145.2 | 0.02 |
| 2145.3 | 0.024 |
| 2145.4 | 0.022 |
| 2145.5 | 0.023 |
| 2145.6 | 0.033 |
| 2145.7 | 0.032 |
| 2145.8 | 0.027 |
| 2145.9 | 0.031 |
| 2146.0 | 0.027 |
| 2146.1 | 0.021 |
| 2146.2 | 0.031 |
| 2146.3 | 0.017 |
| 2146.4 | 0.016 |
| 2146.5 | 0.012 |
| 2146.6 | 0.016 |
| 2146.7 | 0.012 |
| 2146.8 | 0.026 |
| 2146.9 | 0.021 |
| 2147.0 | 0.03 |
| 2147.1 | 0.026 |
| 2147.2 | 0.028 |
| 2147.3 | 0.019 |
| 2147.4 | 0.024 |
| 2147.5 | 0.016 |
| 2147.6 | 0.014 |
| 2147.7 | 0.012 |
| 2147.8 | 0.016 |
| 2147.9 | 0.018 |
| 2148.0 | 0.025 |
| 2148.1 | 0.02 |
| 2148.2 | 0.015 |
| 2148.3 | 0.016 |
| 2148.4 | 0.008 |
| 2148.5 | 0.004 |
| 2148.6 | 0.006 |
| 2148.7 | 0.025 |
| 2148.8 | 0.006 |
| 2148.9 | 0.009 |
| 2149.0 | 0.028 |
| 2149.1 | 0.008 |
| 2149.2 | 0.033 |
| 2149.3 | 0.023 |
| 2149.4 | 0.028 |
| 2149.5 | 0.04 |
| 2149.6 | 0.039 |
| 2149.7 | 0.025 |
| 2149.8 | 0.032 |
| 2149.9 | 0.03 |
| 2150.0 | 0.019 |
| 2150.1 | 0.012 |
| 2150.2 | 0.018 |
| 2150.3 | 0.016 |
| 2150.4 | 0.011 |
| 2150.5 | 0.023 |
| 2150.6 | 0.018 |
| 2150.7 | 0.018 |
| 2150.8 | 0.021 |
| 2150.9 | 0.025 |
| 2151.0 | 0.02 |
| 2151.1 | 0.027 |
| 2151.2 | 0.025 |
| 2151.3 | 0.015 |
| 2151.4 | 0.012 |
| 2151.5 | 0.003 |
| 2151.6 | 0.002 |
| 2151.7 | 0.008 |
| 2151.8 | 0.014 |
| 2151.9 | 0.008 |
| 2152.0 | 0.011 |
| 2152.1 | 0.014 |
| 2152.2 | 0.011 |
| 2152.3 | 0.014 |
| 2152.4 | 0.023 |
| 2152.5 | 0.033 |
| 2152.6 | 0.028 |
| 2152.7 | 0.025 |
| 2152.8 | 0.018 |
| 2152.9 | 0.02 |
| 2153.0 | 0.017 |
| 2153.1 | 0.016 |
| 2153.2 | 0.009 |
| 2153.3 | 0.006 |
| 2153.4 | 0 |
| 2153.5 | 0.005 |
| 2153.6 | 0.011 |
| 2153.7 | 0.021 |
| 2153.8 | 0.018 |
| 2153.9 | 0.021 |
| 2154.0 | 0.019 |
| 2154.1 | 0.011 |
| 2154.2 | 0.005 |
| 2154.3 | 0.011 |
| 2154.4 | 0.014 |
| 2154.5 | 0.009 |
| 2154.6 | 0.015 |
| 2154.7 | 0.022 |
| 2154.8 | 0.027 |
| 2154.9 | 0.027 |
| 2155.0 | 0.031 |
| 2155.1 | 0.035 |
| 2155.2 | 0.035 |
| 2155.3 | 0.026 |
| 2155.4 | 0.027 |
| 2155.5 | 0.03 |
| 2155.6 | 0.026 |
| 2155.7 | 0.024 |
| 2155.8 | 0.027 |
| 2155.9 | 0.015 |
| 2156.0 | 0 |
| 2156.1 | 0.003 |
| 2156.2 | 0.001 |
| 2156.3 | 0.001 |
| 2156.4 | 0.012 |
| 2156.5 | 0.02 |
| 2156.6 | 0.019 |
| 2156.7 | 0.019 |
| 2156.8 | 0.018 |
| 2156.9 | 0.017 |
| 2157.0 | 0.014 |
| 2157.1 | 0.012 |
| 2157.2 | 0.008 |
| 2157.3 | 0.008 |
| 2157.4 | 0.001 |
| 2157.5 | 0.001 |
| 2157.6 | 0.006 |
| 2157.7 | 0.011 |
| 2157.8 | 0.021 |
| 2157.9 | 0.016 |
| 2158.0 | 0.027 |
| 2158.1 | 0.012 |
| 2158.2 | 0.018 |
| 2158.3 | 0.005 |
| 2158.4 | 0.021 |
| 2158.5 | 0.017 |
| 2158.6 | 0.023 |
| 2158.7 | 0.017 |
| 2158.8 | 0.029 |
| 2158.9 | 0.023 |
| 2159.0 | 0.018 |
| 2159.1 | 0.032 |
| 2159.2 | 0.029 |
| 2159.3 | 0.027 |
| 2159.4 | 0.033 |
| 2159.5 | 0.037 |
| 2159.6 | 0.025 |
| 2159.7 | 0.033 |
| 2159.8 | 0.028 |
| 2159.9 | 0.025 |
| 2160.0 | 0.029 |
| 2160.1 | 0.035 |
| 2160.2 | 0.031 |
| 2160.3 | 0.027 |
| 2160.4 | 0.024 |
| 2160.5 | 0.01 |
| 2160.6 | 0.008 |
| 2160.7 | 0.012 |
| 2160.8 | 0.015 |
| 2160.9 | 0.008 |
| 2161.0 | 0.015 |
| 2161.1 | 0.024 |
| 2161.2 | 0.018 |
| 2161.3 | 0.014 |
| 2161.4 | 0.013 |
| 2161.5 | 0.017 |
| 2161.6 | 0.007 |
| 2161.7 | 0.019 |
| 2161.8 | 0.022 |
| 2161.9 | 0.03 |
| 2162.0 | 0.017 |
| 2162.1 | 0.031 |
| 2162.2 | 0.027 |
| 2162.3 | 0.026 |
| 2162.4 | 0.024 |
| 2162.5 | 0.037 |
| 2162.6 | 0.042 |
| 2162.7 | 0.041 |
| 2162.8 | 0.039 |
| 2162.9 | 0.041 |
| 2163.0 | 0.035 |
| 2163.1 | 0.025 |
| 2163.2 | 0.024 |
| 2163.3 | 0.021 |
| 2163.4 | 0.027 |
| 2163.5 | 0.021 |
| 2163.6 | 0.02 |
| 2163.7 | 0.019 |
| 2163.8 | 0.032 |
| 2163.9 | 0.012 |
| 2164.0 | 0.008 |
| 2164.1 | 0.012 |
| 2164.2 | 0.015 |
| 2164.3 | 0.007 |
| 2164.4 | 0.028 |
| 2164.5 | 0.034 |
| 2164.6 | 0.039 |
| 2164.7 | 0.036 |
| 2164.8 | 0.03 |
| 2164.9 | 0.021 |
| 2165.0 | 0.023 |
| 2165.1 | 0.015 |
| 2165.2 | 0.022 |
| 2165.3 | 0.024 |
| 2165.4 | 0.021 |
| 2165.5 | 0.006 |
| 2165.6 | 0.003 |
| 2165.7 | 0.007 |
| 2165.8 | 0.001 |
| 2165.9 | 0.001 |
| 2166.0 | 0.006 |
| 2166.1 | 0.007 |
| 2166.2 | 0.01 |
| 2166.3 | 0.003 |
| 2166.4 | 0.013 |
| 2166.5 | 0.009 |
| 2166.6 | 0.013 |
| 2166.7 | 0.001 |
| 2166.8 | 0.011 |
| 2166.9 | 0.008 |
| 2167.0 | 0.011 |
| 2167.1 | 0.017 |
| 2167.2 | 0.016 |
| 2167.3 | 0.005 |
| 2167.4 | 0.007 |
| 2167.5 | 0.019 |
| 2167.6 | 0.008 |
| 2167.7 | 0.017 |
| 2167.8 | 0.024 |
| 2167.9 | 0.019 |
| 2168.0 | 0.004 |
| 2168.1 | 0.008 |
| 2168.2 | 0.014 |
| 2168.3 | 0.02 |
| 2168.4 | 0.02 |
| 2168.5 | 0.032 |
| 2168.6 | 0.026 |
| 2168.7 | 0.016 |
| 2168.8 | 0.012 |
| 2168.9 | 0.007 |
| 2169.0 | 0.005 |
| 2169.1 | 0.013 |
| 2169.2 | 0.022 |
| 2169.3 | 0.02 |
| 2169.4 | 0.03 |
| 2169.5 | 0.03 |
| 2169.6 | 0.027 |
| 2169.7 | 0.029 |
| 2169.8 | 0.033 |
| 2169.9 | 0.037 |
| 2170.0 | 0.039 |
| 2170.1 | 0.036 |
| 2170.2 | 0.04 |
| 2170.3 | 0.032 |
| 2170.4 | 0.031 |
| 2170.5 | 0.028 |
| 2170.6 | 0.031 |
| 2170.7 | 0.022 |
| 2170.8 | 0.025 |
| 2170.9 | 0.02 |
| 2171.0 | 0.018 |
| 2171.1 | 0.027 |
| 2171.2 | 0.035 |
| 2171.3 | 0.027 |
| 2171.4 | 0.032 |
| 2171.5 | 0.033 |
| 2171.6 | 0.025 |
| 2171.7 | 0.009 |
| 2171.8 | 0.017 |
| 2171.9 | 0.018 |
| 2172.0 | 0.022 |
| 2172.1 | 0.024 |
| 2172.2 | 0.039 |
| 2172.3 | 0.033 |
| 2172.4 | 0.026 |
| 2172.5 | 0.024 |
| 2172.6 | 0.014 |
| 2172.7 | 0.007 |
| 2172.8 | 0.014 |
| 2172.9 | 0.01 |
| 2173.0 | 0.006 |
| 2173.1 | 0.004 |
| 2173.2 | 0.013 |
| 2173.3 | 0.01 |
| 2173.4 | 0.014 |
| 2173.5 | 0.021 |
| 2173.6 | 0.03 |
| 2173.7 | 0.022 |
| 2173.8 | 0.028 |
| 2173.9 | 0.025 |
| 2174.0 | 0.022 |
| 2174.1 | 0.018 |
| 2174.2 | 0.019 |
| 2174.3 | 0.018 |
| 2174.4 | 0.015 |
| 2174.5 | 0.008 |
| 2174.6 | 0.015 |
| 2174.7 | 0.007 |
| 2174.8 | 0.018 |
| 2174.9 | 0.007 |
| 2175.0 | 0.007 |
| 2175.1 | 0.007 |
| 2175.2 | 0.001 |
| 2175.3 | 0.007 |
| 2175.4 | 0.007 |
| 2175.5 | 0.001 |
| 2175.6 | 0 |
| 2175.7 | 0.001 |
| 2175.8 | 0.012 |
| 2175.9 | 0.021 |
| 2176.0 | 0.016 |
| 2176.1 | 0.02 |
| 2176.2 | 0.016 |
| 2176.3 | 0.02 |
| 2176.4 | 0.011 |
| 2176.5 | 0.008 |
| 2176.6 | 0.003 |
| 2176.7 | 0.003 |
| 2176.8 | 0 |
| 2176.9 | 0.007 |
| 2177.0 | 0.005 |
| 2177.1 | 0.021 |
| 2177.2 | 0.017 |
| 2177.3 | 0.012 |
| 2177.4 | 0.024 |
| 2177.5 | 0.028 |
| 2177.6 | 0.016 |
| 2177.7 | 0.024 |
| 2177.8 | 0.03 |
| 2177.9 | 0.026 |
| 2178.0 | 0.028 |
| 2178.1 | 0.037 |
| 2178.2 | 0.027 |
| 2178.3 | 0.024 |
| 2178.4 | 0.018 |
| 2178.5 | 0.021 |
| 2178.6 | 0.017 |
| 2178.7 | 0.029 |
| 2178.8 | 0.03 |
| 2178.9 | 0.034 |
| 2179.0 | 0.02 |
| 2179.1 | 0.021 |
| 2179.2 | 0.017 |
| 2179.3 | 0.015 |
| 2179.4 | 0.007 |
| 2179.5 | 0.01 |
| 2179.6 | 0.011 |
| 2179.7 | 0.011 |
| 2179.8 | 0.017 |
| 2179.9 | 0.029 |
| 2180.0 | 0.033 |
| 2180.1 | 0.027 |
| 2180.2 | 0.03 |
| 2180.3 | 0.024 |
| 2180.4 | 0.015 |
| 2180.5 | 0.004 |
| 2180.6 | 0.011 |
| 2180.7 | 0.014 |
| 2180.8 | 0.016 |
| 2180.9 | 0.02 |
| 2181.0 | 0.034 |
| 2181.1 | 0.035 |
| 2181.2 | 0.023 |
| 2181.3 | 0.017 |
| 2181.4 | 0.014 |
| 2181.5 | 0.01 |
| 2181.6 | 0.008 |
| 2181.7 | 0.014 |
| 2181.8 | 0.02 |
| 2181.9 | 0.025 |
| 2182.0 | 0.022 |
| 2182.1 | 0.01 |
| 2182.2 | 0.006 |
| 2182.3 | 0.016 |
| 2182.4 | 0.015 |
| 2182.5 | 0.021 |
| 2182.6 | 0.03 |
| 2182.7 | 0.032 |
| 2182.8 | 0.025 |
| 2182.9 | 0.025 |
| 2183.0 | 0.024 |
| 2183.1 | 0.039 |
| 2183.2 | 0.041 |
| 2183.3 | 0.041 |
| 2183.4 | 0.032 |
| 2183.5 | 0.036 |
| 2183.6 | 0.02 |
| 2183.7 | 0.019 |
| 2183.8 | 0.021 |
| 2183.9 | 0.03 |
| 2184.0 | 0.021 |
| 2184.1 | 0.013 |
| 2184.2 | 0.01 |
| 2184.3 | 0.005 |
| 2184.4 | 0.003 |
| 2184.5 | 0.021 |
| 2184.6 | 0.01 |
| 2184.7 | 0.003 |
| 2184.8 | 0.005 |
| 2184.9 | 0.012 |
| 2185.0 | 0.018 |
| 2185.1 | 0.022 |
| 2185.2 | 0.031 |
| 2185.3 | 0.03 |
| 2185.4 | 0.032 |
| 2185.5 | 0.028 |
| 2185.6 | 0.029 |
| 2185.7 | 0.045 |
| 2185.8 | 0.045 |
| 2185.9 | 0.033 |
| 2186.0 | 0.04 |
| 2186.1 | 0.022 |
| 2186.2 | 0.011 |
| 2186.3 | 0.005 |
| 2186.4 | 0.005 |
| 2186.5 | 0.011 |
| 2186.6 | 0.008 |
| 2186.7 | 0.009 |
| 2186.8 | 0.014 |
| 2186.9 | 0.008 |
| 2187.0 | 0.011 |
| 2187.1 | 0.024 |
| 2187.2 | 0.009 |
| 2187.3 | 0.017 |
| 2187.4 | 0.013 |
| 2187.5 | 0.017 |
| 2187.6 | 0.009 |
| 2187.7 | 0.017 |
| 2187.8 | 0.009 |
| 2187.9 | 0.018 |
| 2188.0 | 0.007 |
| 2188.1 | 0.008 |
| 2188.2 | 0.017 |
| 2188.3 | 0.032 |
| 2188.4 | 0.039 |
| 2188.5 | 0.032 |
| 2188.6 | 0.038 |
| 2188.7 | 0.035 |
| 2188.8 | 0.036 |
| 2188.9 | 0.034 |
| 2189.0 | 0.032 |
| 2189.1 | 0.026 |
| 2189.2 | 0.018 |
| 2189.3 | 0.008 |
| 2189.4 | 0.018 |
| 2189.5 | 0.039 |
| 2189.6 | 0.008 |
| 2189.7 | 0.013 |
| 2189.8 | 0.027 |
| 2189.9 | 0.026 |
| 2190.0 | 0.025 |
| 2190.1 | 0.026 |
| 2190.2 | 0.023 |
| 2190.3 | 0.02 |
| 2190.4 | 0.023 |
| 2190.5 | 0.011 |
| 2190.6 | 0.003 |
| 2190.7 | 0.011 |
| 2190.8 | 0.007 |
| 2190.9 | 0.011 |
| 2191.0 | 0.015 |
| 2191.1 | 0.005 |
| 2191.2 | 0.011 |
| 2191.3 | 0.019 |
| 2191.4 | 0 |
| 2191.5 | 0.019 |
| 2191.6 | 0.037 |
| 2191.7 | 0.043 |
| 2191.8 | 0.04 |
| 2191.9 | 0.037 |
| 2192.0 | 0.03 |
| 2192.1 | 0.028 |
| 2192.2 | 0.029 |
| 2192.3 | 0.04 |
| 2192.4 | 0.046 |
| 2192.5 | 0.047 |
| 2192.6 | 0.049 |
| 2192.7 | 0.038 |
| 2192.8 | 0.016 |
| 2192.9 | 0.007 |
| 2193.0 | 0.008 |
| 2193.1 | 0.028 |
| 2193.2 | 0.009 |
| 2193.3 | 0.025 |
| 2193.4 | 0.028 |
| 2193.5 | 0.021 |
| 2193.6 | 0.018 |
| 2193.7 | 0.018 |
| 2193.8 | 0.003 |
| 2193.9 | 0.001 |
| 2194.0 | 0.001 |
| 2194.1 | 0.01 |
| 2194.2 | 0.016 |
| 2194.3 | 0.022 |
| 2194.4 | 0.026 |
| 2194.5 | 0.026 |
| 2194.6 | 0.023 |
| 2194.7 | 0.023 |
| 2194.8 | 0.018 |
| 2194.9 | 0.006 |
| 2195.0 | 0.001 |
| 2195.1 | 0.006 |
| 2195.2 | 0.01 |
| 2195.3 | 0.001 |
| 2195.4 | 0.01 |
| 2195.5 | 0.016 |
| 2195.6 | 0.013 |
| 2195.7 | 0.015 |
| 2195.8 | 0.022 |
| 2195.9 | 0.018 |
| 2196.0 | 0.033 |
| 2196.1 | 0.032 |
| 2196.2 | 0.024 |
| 2196.3 | 0.03 |
| 2196.4 | 0.035 |
| 2196.5 | 0.041 |
| 2196.6 | 0.035 |
| 2196.7 | 0.032 |
| 2196.8 | 0.019 |
| 2196.9 | 0.005 |
| 2197.0 | 0.02 |
| 2197.1 | 0.005 |
| 2197.2 | 0.02 |
| 2197.3 | 0.032 |
| 2197.4 | 0.051 |
| 2197.5 | 0.06 |
| 2197.6 | 0.048 |
| 2197.7 | 0.032 |
| 2197.8 | 0.031 |
| 2197.9 | 0.019 |
| 2198.0 | 0.013 |
| 2198.1 | 0.018 |
| 2198.2 | 0.035 |
| 2198.3 | 0.021 |
| 2198.4 | 0.023 |
| 2198.5 | 0.027 |
| 2198.6 | 0.038 |
| 2198.7 | 0.022 |
| 2198.8 | 0.035 |
| 2198.9 | 0.036 |
| 2199.0 | 0.036 |
| 2199.1 | 0.028 |
| 2199.2 | 0.043 |
| 2199.3 | 0.045 |
| 2199.4 | 0.039 |
| 2199.5 | 0.04 |
| 2199.6 | 0.041 |
| 2199.7 | 0.027 |
| 2199.8 | 0.029 |
| 2199.9 | 0.038 |
| 2200.0 | 0.04 |